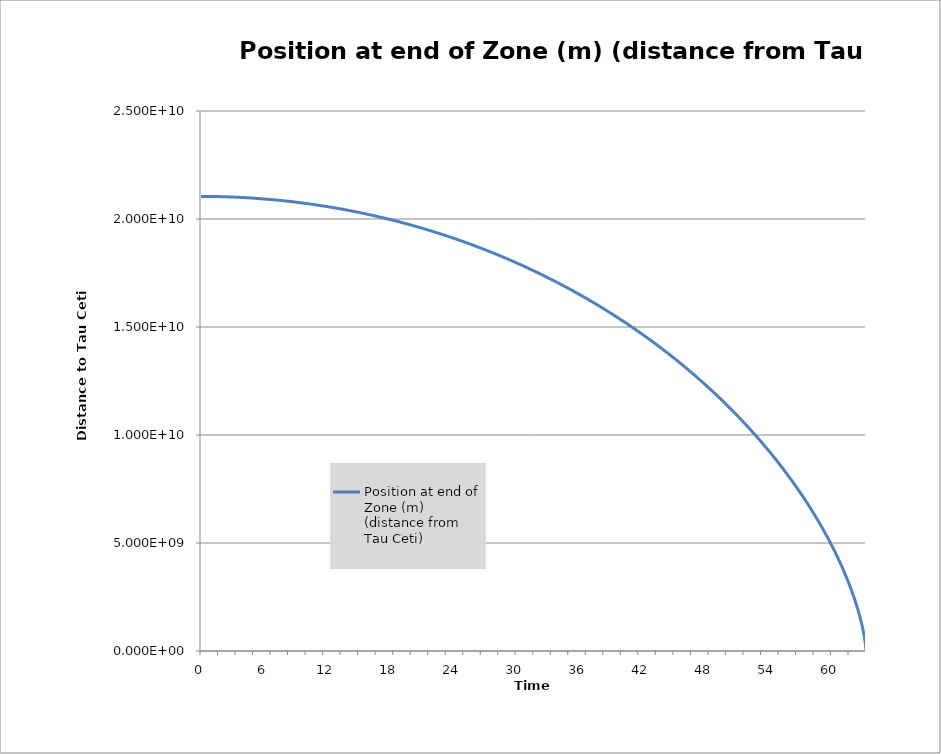
| Category | Position at end of Zone (m) (distance from Tau Ceti) |
|---|---|
| 0.0 | 21045999099.302 |
| 0.016666666666666666 | 21045996397.209 |
| 0.03333333333333333 | 21045991893.72 |
| 0.05 | 21045985588.834 |
| 0.06666666666666667 | 21045977482.551 |
| 0.08333333333333333 | 21045967574.87 |
| 0.09999999999999999 | 21045955865.788 |
| 0.11666666666666665 | 21045942355.304 |
| 0.13333333333333333 | 21045927043.416 |
| 0.15 | 21045909930.122 |
| 0.16666666666666666 | 21045891015.418 |
| 0.18333333333333332 | 21045870299.302 |
| 0.19999999999999998 | 21045847781.769 |
| 0.21666666666666665 | 21045823462.817 |
| 0.2333333333333333 | 21045797342.442 |
| 0.24999999999999997 | 21045769420.638 |
| 0.26666666666666666 | 21045739697.402 |
| 0.2833333333333333 | 21045708172.729 |
| 0.3 | 21045674846.613 |
| 0.31666666666666665 | 21045639719.048 |
| 0.3333333333333333 | 21045602790.03 |
| 0.35 | 21045564059.551 |
| 0.36666666666666664 | 21045523527.605 |
| 0.3833333333333333 | 21045481194.186 |
| 0.39999999999999997 | 21045437059.286 |
| 0.41666666666666663 | 21045391122.898 |
| 0.4333333333333333 | 21045343385.015 |
| 0.44999999999999996 | 21045293845.627 |
| 0.4666666666666666 | 21045242504.728 |
| 0.4833333333333333 | 21045189362.307 |
| 0.49999999999999994 | 21045134418.358 |
| 0.5166666666666666 | 21045077672.869 |
| 0.5333333333333333 | 21045019125.831 |
| 0.55 | 21044958777.235 |
| 0.5666666666666668 | 21044896627.071 |
| 0.5833333333333335 | 21044832675.328 |
| 0.6000000000000002 | 21044766921.995 |
| 0.6166666666666669 | 21044699367.061 |
| 0.6333333333333336 | 21044630010.514 |
| 0.6500000000000004 | 21044558852.344 |
| 0.6666666666666671 | 21044485892.537 |
| 0.6833333333333338 | 21044411131.082 |
| 0.7000000000000005 | 21044334567.966 |
| 0.7166666666666672 | 21044256203.176 |
| 0.733333333333334 | 21044176036.698 |
| 0.7500000000000007 | 21044094068.52 |
| 0.7666666666666674 | 21044010298.627 |
| 0.7833333333333341 | 21043924727.005 |
| 0.8000000000000008 | 21043837353.639 |
| 0.8166666666666675 | 21043748178.515 |
| 0.8333333333333343 | 21043657201.618 |
| 0.850000000000001 | 21043564422.932 |
| 0.8666666666666677 | 21043469842.442 |
| 0.8833333333333344 | 21043373460.131 |
| 0.9000000000000011 | 21043275275.983 |
| 0.9166666666666679 | 21043175289.982 |
| 0.9333333333333346 | 21043073502.11 |
| 0.9500000000000013 | 21042969912.35 |
| 0.966666666666668 | 21042864520.685 |
| 0.9833333333333347 | 21042757327.096 |
| 1.0000000000000013 | 21042648331.566 |
| 1.016666666666668 | 21042537534.076 |
| 1.0333333333333345 | 21042424934.607 |
| 1.0500000000000012 | 21042310533.14 |
| 1.0666666666666678 | 21042194329.656 |
| 1.0833333333333344 | 21042076324.134 |
| 1.100000000000001 | 21041956516.556 |
| 1.1166666666666676 | 21041834906.899 |
| 1.1333333333333342 | 21041711495.145 |
| 1.1500000000000008 | 21041586281.271 |
| 1.1666666666666674 | 21041459265.257 |
| 1.183333333333334 | 21041330447.08 |
| 1.2000000000000006 | 21041199826.72 |
| 1.2166666666666672 | 21041067404.153 |
| 1.2333333333333338 | 21040933179.357 |
| 1.2500000000000004 | 21040797152.31 |
| 1.266666666666667 | 21040659322.988 |
| 1.2833333333333337 | 21040519691.368 |
| 1.3000000000000003 | 21040378257.426 |
| 1.3166666666666669 | 21040235021.137 |
| 1.3333333333333335 | 21040089982.478 |
| 1.35 | 21039943141.424 |
| 1.3666666666666667 | 21039794497.95 |
| 1.3833333333333333 | 21039644052.03 |
| 1.4 | 21039491803.64 |
| 1.4166666666666665 | 21039337752.752 |
| 1.4333333333333331 | 21039181899.34 |
| 1.4499999999999997 | 21039024243.379 |
| 1.4666666666666663 | 21038864784.842 |
| 1.483333333333333 | 21038703523.7 |
| 1.4999999999999996 | 21038540459.927 |
| 1.5166666666666662 | 21038375593.495 |
| 1.5333333333333328 | 21038208924.376 |
| 1.5499999999999994 | 21038040452.541 |
| 1.566666666666666 | 21037870177.962 |
| 1.5833333333333326 | 21037698100.609 |
| 1.5999999999999992 | 21037524220.454 |
| 1.6166666666666658 | 21037348537.466 |
| 1.6333333333333324 | 21037171051.616 |
| 1.649999999999999 | 21036991762.873 |
| 1.6666666666666656 | 21036810671.207 |
| 1.6833333333333322 | 21036627776.587 |
| 1.6999999999999988 | 21036443078.982 |
| 1.7166666666666655 | 21036256578.36 |
| 1.733333333333332 | 21036068274.69 |
| 1.7499999999999987 | 21035878167.938 |
| 1.7666666666666653 | 21035686258.074 |
| 1.7833333333333319 | 21035492545.064 |
| 1.7999999999999985 | 21035297028.875 |
| 1.816666666666665 | 21035099709.473 |
| 1.8333333333333317 | 21034900586.826 |
| 1.8499999999999983 | 21034699660.898 |
| 1.866666666666665 | 21034496931.657 |
| 1.8833333333333315 | 21034292399.066 |
| 1.8999999999999981 | 21034086063.092 |
| 1.9166666666666647 | 21033877923.698 |
| 1.9333333333333313 | 21033667980.851 |
| 1.949999999999998 | 21033456234.512 |
| 1.9666666666666646 | 21033242684.648 |
| 1.9833333333333312 | 21033027331.22 |
| 1.9999999999999978 | 21032810174.192 |
| 2.0166666666666644 | 21032591213.528 |
| 2.033333333333331 | 21032370449.189 |
| 2.0499999999999976 | 21032147881.138 |
| 2.066666666666664 | 21031923509.338 |
| 2.083333333333331 | 21031697333.749 |
| 2.0999999999999974 | 21031469354.332 |
| 2.116666666666664 | 21031239571.05 |
| 2.1333333333333306 | 21031007983.863 |
| 2.1499999999999972 | 21030774592.731 |
| 2.166666666666664 | 21030539397.615 |
| 2.1833333333333305 | 21030302398.473 |
| 2.199999999999997 | 21030063595.266 |
| 2.2166666666666637 | 21029822987.954 |
| 2.2333333333333303 | 21029580576.493 |
| 2.249999999999997 | 21029336360.844 |
| 2.2666666666666635 | 21029090340.965 |
| 2.28333333333333 | 21028842516.813 |
| 2.2999999999999967 | 21028592888.346 |
| 2.3166666666666633 | 21028341455.521 |
| 2.33333333333333 | 21028088218.296 |
| 2.3499999999999965 | 21027833176.627 |
| 2.366666666666663 | 21027576330.47 |
| 2.3833333333333298 | 21027317679.782 |
| 2.3999999999999964 | 21027057224.519 |
| 2.416666666666663 | 21026794964.635 |
| 2.4333333333333296 | 21026530900.086 |
| 2.449999999999996 | 21026265030.826 |
| 2.466666666666663 | 21025997356.811 |
| 2.4833333333333294 | 21025727877.995 |
| 2.499999999999996 | 21025456594.33 |
| 2.5166666666666626 | 21025183505.772 |
| 2.533333333333329 | 21024908612.273 |
| 2.549999999999996 | 21024631913.786 |
| 2.5666666666666624 | 21024353410.264 |
| 2.583333333333329 | 21024073101.659 |
| 2.5999999999999956 | 21023790987.923 |
| 2.6166666666666623 | 21023507069.008 |
| 2.633333333333329 | 21023221344.865 |
| 2.6499999999999955 | 21022933815.445 |
| 2.666666666666662 | 21022644480.7 |
| 2.6833333333333287 | 21022353340.579 |
| 2.6999999999999953 | 21022060395.033 |
| 2.716666666666662 | 21021765644.012 |
| 2.7333333333333285 | 21021469087.464 |
| 2.749999999999995 | 21021170725.34 |
| 2.7666666666666617 | 21020870557.588 |
| 2.7833333333333283 | 21020568584.157 |
| 2.799999999999995 | 21020264804.995 |
| 2.8166666666666615 | 21019959220.05 |
| 2.833333333333328 | 21019651829.269 |
| 2.8499999999999948 | 21019342632.601 |
| 2.8666666666666614 | 21019031629.992 |
| 2.883333333333328 | 21018718821.388 |
| 2.8999999999999946 | 21018404206.737 |
| 2.916666666666661 | 21018087785.984 |
| 2.933333333333328 | 21017769559.074 |
| 2.9499999999999944 | 21017449525.955 |
| 2.966666666666661 | 21017127686.57 |
| 2.9833333333333276 | 21016804040.864 |
| 2.9999999999999942 | 21016478588.783 |
| 3.016666666666661 | 21016151330.269 |
| 3.0333333333333274 | 21015822265.268 |
| 3.049999999999994 | 21015491393.722 |
| 3.0666666666666607 | 21015158715.576 |
| 3.0833333333333273 | 21014824230.771 |
| 3.099999999999994 | 21014487939.251 |
| 3.1166666666666605 | 21014149840.957 |
| 3.133333333333327 | 21013809935.833 |
| 3.1499999999999937 | 21013468223.819 |
| 3.1666666666666603 | 21013124704.857 |
| 3.183333333333327 | 21012779378.888 |
| 3.1999999999999935 | 21012432245.853 |
| 3.21666666666666 | 21012083305.693 |
| 3.2333333333333267 | 21011732558.346 |
| 3.2499999999999933 | 21011380003.754 |
| 3.26666666666666 | 21011025641.856 |
| 3.2833333333333266 | 21010669472.591 |
| 3.299999999999993 | 21010311495.897 |
| 3.3166666666666598 | 21009951711.714 |
| 3.3333333333333264 | 21009590119.979 |
| 3.349999999999993 | 21009226720.631 |
| 3.3666666666666596 | 21008861513.607 |
| 3.383333333333326 | 21008494498.845 |
| 3.399999999999993 | 21008125676.281 |
| 3.4166666666666594 | 21007755045.852 |
| 3.433333333333326 | 21007382607.495 |
| 3.4499999999999926 | 21007008361.146 |
| 3.4666666666666592 | 21006632306.739 |
| 3.483333333333326 | 21006254444.212 |
| 3.4999999999999925 | 21005874773.498 |
| 3.516666666666659 | 21005493294.533 |
| 3.5333333333333257 | 21005110007.251 |
| 3.5499999999999923 | 21004724911.586 |
| 3.566666666666659 | 21004338007.473 |
| 3.5833333333333255 | 21003949294.844 |
| 3.599999999999992 | 21003558773.633 |
| 3.6166666666666587 | 21003166443.773 |
| 3.6333333333333253 | 21002772305.196 |
| 3.649999999999992 | 21002376357.834 |
| 3.6666666666666585 | 21001978601.621 |
| 3.683333333333325 | 21001579036.486 |
| 3.6999999999999917 | 21001177662.362 |
| 3.7166666666666583 | 21000774479.18 |
| 3.733333333333325 | 21000369486.87 |
| 3.7499999999999916 | 20999962685.362 |
| 3.766666666666658 | 20999554074.588 |
| 3.7833333333333248 | 20999143654.475 |
| 3.7999999999999914 | 20998731424.955 |
| 3.816666666666658 | 20998317385.955 |
| 3.8333333333333246 | 20997901537.405 |
| 3.849999999999991 | 20997483879.234 |
| 3.866666666666658 | 20997064411.369 |
| 3.8833333333333244 | 20996643133.738 |
| 3.899999999999991 | 20996220046.269 |
| 3.9166666666666576 | 20995795148.889 |
| 3.9333333333333242 | 20995368441.525 |
| 3.949999999999991 | 20994939924.104 |
| 3.9666666666666575 | 20994509596.551 |
| 3.983333333333324 | 20994077458.793 |
| 3.9999999999999907 | 20993643510.755 |
| 4.016666666666658 | 20993207752.363 |
| 4.033333333333324 | 20992770183.542 |
| 4.049999999999991 | 20992330804.216 |
| 4.0666666666666575 | 20991889614.31 |
| 4.083333333333324 | 20991446613.748 |
| 4.099999999999991 | 20991001802.453 |
| 4.116666666666657 | 20990555180.349 |
| 4.133333333333324 | 20990106747.359 |
| 4.149999999999991 | 20989656503.406 |
| 4.166666666666657 | 20989204448.412 |
| 4.183333333333324 | 20988750582.3 |
| 4.19999999999999 | 20988294904.991 |
| 4.216666666666657 | 20987837416.406 |
| 4.233333333333324 | 20987378116.468 |
| 4.24999999999999 | 20986917005.096 |
| 4.266666666666657 | 20986454082.212 |
| 4.2833333333333234 | 20985989347.735 |
| 4.29999999999999 | 20985522801.586 |
| 4.316666666666657 | 20985054443.684 |
| 4.333333333333323 | 20984584273.949 |
| 4.34999999999999 | 20984112292.299 |
| 4.3666666666666565 | 20983638498.653 |
| 4.383333333333323 | 20983162892.929 |
| 4.39999999999999 | 20982685475.046 |
| 4.416666666666656 | 20982206244.921 |
| 4.433333333333323 | 20981725202.471 |
| 4.4499999999999895 | 20981242347.614 |
| 4.466666666666656 | 20980757680.266 |
| 4.483333333333323 | 20980271200.343 |
| 4.499999999999989 | 20979782907.763 |
| 4.516666666666656 | 20979292802.44 |
| 4.533333333333323 | 20978800884.29 |
| 4.549999999999989 | 20978307153.228 |
| 4.566666666666656 | 20977811609.169 |
| 4.583333333333322 | 20977314252.027 |
| 4.599999999999989 | 20976815081.718 |
| 4.616666666666656 | 20976314098.153 |
| 4.633333333333322 | 20975811301.248 |
| 4.649999999999989 | 20975306690.915 |
| 4.666666666666655 | 20974800267.067 |
| 4.683333333333322 | 20974292029.617 |
| 4.699999999999989 | 20973781978.477 |
| 4.716666666666655 | 20973270113.559 |
| 4.733333333333322 | 20972756434.775 |
| 4.7499999999999885 | 20972240942.035 |
| 4.766666666666655 | 20971723635.251 |
| 4.783333333333322 | 20971204514.334 |
| 4.799999999999988 | 20970683579.194 |
| 4.816666666666655 | 20970160829.741 |
| 4.8333333333333215 | 20969636265.884 |
| 4.849999999999988 | 20969109887.534 |
| 4.866666666666655 | 20968581694.598 |
| 4.883333333333321 | 20968051686.986 |
| 4.899999999999988 | 20967519864.607 |
| 4.9166666666666545 | 20966986227.367 |
| 4.933333333333321 | 20966450775.176 |
| 4.949999999999988 | 20965913507.94 |
| 4.966666666666654 | 20965374425.567 |
| 4.983333333333321 | 20964833527.964 |
| 4.999999999999988 | 20964290815.036 |
| 5.016666666666654 | 20963746286.691 |
| 5.033333333333321 | 20963199942.834 |
| 5.049999999999987 | 20962651783.37 |
| 5.066666666666654 | 20962101808.205 |
| 5.083333333333321 | 20961550017.243 |
| 5.099999999999987 | 20960996410.39 |
| 5.116666666666654 | 20960440987.549 |
| 5.13333333333332 | 20959883748.624 |
| 5.149999999999987 | 20959324693.52 |
| 5.166666666666654 | 20958763822.138 |
| 5.18333333333332 | 20958201134.383 |
| 5.199999999999987 | 20957636630.156 |
| 5.2166666666666535 | 20957070309.36 |
| 5.23333333333332 | 20956502171.898 |
| 5.249999999999987 | 20955932217.67 |
| 5.266666666666653 | 20955360446.578 |
| 5.28333333333332 | 20954786858.523 |
| 5.2999999999999865 | 20954211453.406 |
| 5.316666666666653 | 20953634231.127 |
| 5.33333333333332 | 20953055191.586 |
| 5.349999999999986 | 20952474334.683 |
| 5.366666666666653 | 20951891660.318 |
| 5.3833333333333195 | 20951307168.388 |
| 5.399999999999986 | 20950720858.794 |
| 5.416666666666653 | 20950132731.433 |
| 5.433333333333319 | 20949542786.203 |
| 5.449999999999986 | 20948951023.003 |
| 5.466666666666653 | 20948357441.73 |
| 5.483333333333319 | 20947762042.281 |
| 5.499999999999986 | 20947164824.552 |
| 5.516666666666652 | 20946565788.441 |
| 5.533333333333319 | 20945964933.843 |
| 5.549999999999986 | 20945362260.654 |
| 5.566666666666652 | 20944757768.77 |
| 5.583333333333319 | 20944151458.086 |
| 5.599999999999985 | 20943543328.496 |
| 5.616666666666652 | 20942933379.896 |
| 5.633333333333319 | 20942321612.179 |
| 5.649999999999985 | 20941708025.24 |
| 5.666666666666652 | 20941092618.971 |
| 5.6833333333333185 | 20940475393.266 |
| 5.699999999999985 | 20939856348.019 |
| 5.716666666666652 | 20939235483.121 |
| 5.733333333333318 | 20938612798.465 |
| 5.749999999999985 | 20937988293.943 |
| 5.7666666666666515 | 20937361969.446 |
| 5.783333333333318 | 20936733824.865 |
| 5.799999999999985 | 20936103860.092 |
| 5.816666666666651 | 20935472075.018 |
| 5.833333333333318 | 20934838469.532 |
| 5.8499999999999845 | 20934203043.524 |
| 5.866666666666651 | 20933565796.885 |
| 5.883333333333318 | 20932926729.503 |
| 5.899999999999984 | 20932285841.267 |
| 5.916666666666651 | 20931643132.066 |
| 5.933333333333318 | 20930998601.789 |
| 5.949999999999984 | 20930352250.323 |
| 5.966666666666651 | 20929704077.556 |
| 5.983333333333317 | 20929054083.376 |
| 5.999999999999984 | 20928402267.669 |
| 6.016666666666651 | 20927748630.322 |
| 6.033333333333317 | 20927093171.222 |
| 6.049999999999984 | 20926435890.254 |
| 6.06666666666665 | 20925776787.304 |
| 6.083333333333317 | 20925115862.258 |
| 6.099999999999984 | 20924453115.001 |
| 6.11666666666665 | 20923788545.418 |
| 6.133333333333317 | 20923122153.392 |
| 6.1499999999999835 | 20922453938.808 |
| 6.16666666666665 | 20921783901.549 |
| 6.183333333333317 | 20921112041.5 |
| 6.199999999999983 | 20920438358.543 |
| 6.21666666666665 | 20919762852.56 |
| 6.2333333333333165 | 20919085523.435 |
| 6.249999999999983 | 20918406371.05 |
| 6.26666666666665 | 20917725395.285 |
| 6.283333333333316 | 20917042596.024 |
| 6.299999999999983 | 20916357973.146 |
| 6.3166666666666496 | 20915671526.532 |
| 6.333333333333316 | 20914983256.064 |
| 6.349999999999983 | 20914293161.62 |
| 6.366666666666649 | 20913601243.082 |
| 6.383333333333316 | 20912907500.327 |
| 6.399999999999983 | 20912211933.237 |
| 6.416666666666649 | 20911514541.688 |
| 6.433333333333316 | 20910815325.56 |
| 6.449999999999982 | 20910114284.731 |
| 6.466666666666649 | 20909411419.079 |
| 6.483333333333316 | 20908706728.481 |
| 6.499999999999982 | 20908000212.814 |
| 6.516666666666649 | 20907291871.956 |
| 6.5333333333333155 | 20906581705.781 |
| 6.549999999999982 | 20905869714.168 |
| 6.566666666666649 | 20905155896.991 |
| 6.583333333333315 | 20904440254.127 |
| 6.599999999999982 | 20903722785.449 |
| 6.6166666666666485 | 20903003490.834 |
| 6.633333333333315 | 20902282370.155 |
| 6.649999999999982 | 20901559423.287 |
| 6.666666666666648 | 20900834650.103 |
| 6.683333333333315 | 20900108050.478 |
| 6.6999999999999815 | 20899379624.283 |
| 6.716666666666648 | 20898649371.393 |
| 6.733333333333315 | 20897917291.679 |
| 6.749999999999981 | 20897183385.014 |
| 6.766666666666648 | 20896447651.27 |
| 6.783333333333315 | 20895710090.317 |
| 6.799999999999981 | 20894970702.028 |
| 6.816666666666648 | 20894229486.273 |
| 6.833333333333314 | 20893486442.922 |
| 6.849999999999981 | 20892741571.846 |
| 6.866666666666648 | 20891994872.914 |
| 6.883333333333314 | 20891246345.997 |
| 6.899999999999981 | 20890495990.963 |
| 6.916666666666647 | 20889743807.681 |
| 6.933333333333314 | 20888989796.019 |
| 6.949999999999981 | 20888233955.846 |
| 6.966666666666647 | 20887476287.03 |
| 6.983333333333314 | 20886716789.438 |
| 6.9999999999999805 | 20885955462.937 |
| 7.016666666666647 | 20885192307.394 |
| 7.033333333333314 | 20884427322.675 |
| 7.04999999999998 | 20883660508.647 |
| 7.066666666666647 | 20882891865.176 |
| 7.0833333333333135 | 20882121392.127 |
| 7.09999999999998 | 20881349089.365 |
| 7.116666666666647 | 20880574956.754 |
| 7.133333333333313 | 20879798994.161 |
| 7.14999999999998 | 20879021201.448 |
| 7.1666666666666465 | 20878241578.479 |
| 7.183333333333313 | 20877460125.118 |
| 7.19999999999998 | 20876676841.228 |
| 7.216666666666646 | 20875891726.672 |
| 7.233333333333313 | 20875104781.312 |
| 7.24999999999998 | 20874316005.01 |
| 7.266666666666646 | 20873525397.629 |
| 7.283333333333313 | 20872732959.029 |
| 7.299999999999979 | 20871938689.072 |
| 7.316666666666646 | 20871142587.619 |
| 7.333333333333313 | 20870344654.53 |
| 7.349999999999979 | 20869544889.664 |
| 7.366666666666646 | 20868743292.883 |
| 7.383333333333312 | 20867939864.044 |
| 7.399999999999979 | 20867134603.008 |
| 7.416666666666646 | 20866327509.633 |
| 7.433333333333312 | 20865518583.778 |
| 7.449999999999979 | 20864707825.3 |
| 7.4666666666666455 | 20863895234.058 |
| 7.483333333333312 | 20863080809.908 |
| 7.499999999999979 | 20862264552.708 |
| 7.516666666666645 | 20861446462.315 |
| 7.533333333333312 | 20860626538.584 |
| 7.5499999999999785 | 20859804781.373 |
| 7.566666666666645 | 20858981190.536 |
| 7.583333333333312 | 20858155765.929 |
| 7.599999999999978 | 20857328507.407 |
| 7.616666666666645 | 20856499414.825 |
| 7.6333333333333115 | 20855668488.036 |
| 7.649999999999978 | 20854835726.896 |
| 7.666666666666645 | 20854001131.258 |
| 7.683333333333311 | 20853164700.975 |
| 7.699999999999978 | 20852326435.899 |
| 7.716666666666645 | 20851486335.885 |
| 7.733333333333311 | 20850644400.783 |
| 7.749999999999978 | 20849800630.446 |
| 7.766666666666644 | 20848955024.726 |
| 7.783333333333311 | 20848107583.474 |
| 7.799999999999978 | 20847258306.54 |
| 7.816666666666644 | 20846407193.776 |
| 7.833333333333311 | 20845554245.032 |
| 7.849999999999977 | 20844699460.157 |
| 7.866666666666644 | 20843842839.001 |
| 7.883333333333311 | 20842984381.414 |
| 7.899999999999977 | 20842124087.243 |
| 7.916666666666644 | 20841261956.339 |
| 7.9333333333333105 | 20840397988.549 |
| 7.949999999999977 | 20839532183.72 |
| 7.966666666666644 | 20838664541.701 |
| 7.98333333333331 | 20837795062.338 |
| 7.999999999999977 | 20836923745.479 |
| 8.016666666666644 | 20836050590.97 |
| 8.033333333333312 | 20835175598.656 |
| 8.04999999999998 | 20834298768.385 |
| 8.066666666666647 | 20833420100 |
| 8.083333333333314 | 20832539593.348 |
| 8.099999999999982 | 20831657248.273 |
| 8.11666666666665 | 20830773064.62 |
| 8.133333333333317 | 20829887042.233 |
| 8.149999999999984 | 20828999180.955 |
| 8.166666666666652 | 20828109480.629 |
| 8.18333333333332 | 20827217941.1 |
| 8.199999999999987 | 20826324562.209 |
| 8.216666666666654 | 20825429343.799 |
| 8.233333333333322 | 20824532285.711 |
| 8.24999999999999 | 20823633387.789 |
| 8.266666666666657 | 20822732649.872 |
| 8.283333333333324 | 20821830071.802 |
| 8.299999999999992 | 20820925653.42 |
| 8.31666666666666 | 20820019394.566 |
| 8.333333333333327 | 20819111295.079 |
| 8.349999999999994 | 20818201354.799 |
| 8.366666666666662 | 20817289573.566 |
| 8.38333333333333 | 20816375951.219 |
| 8.399999999999997 | 20815460487.596 |
| 8.416666666666664 | 20814543182.534 |
| 8.433333333333332 | 20813624035.873 |
| 8.45 | 20812703047.45 |
| 8.466666666666667 | 20811780217.101 |
| 8.483333333333334 | 20810855544.663 |
| 8.500000000000002 | 20809929029.974 |
| 8.51666666666667 | 20809000672.869 |
| 8.533333333333337 | 20808070473.184 |
| 8.550000000000004 | 20807138430.754 |
| 8.566666666666672 | 20806204545.415 |
| 8.58333333333334 | 20805268817 |
| 8.600000000000007 | 20804331245.346 |
| 8.616666666666674 | 20803391830.285 |
| 8.633333333333342 | 20802450571.651 |
| 8.65000000000001 | 20801507469.277 |
| 8.666666666666677 | 20800562522.997 |
| 8.683333333333344 | 20799615732.643 |
| 8.700000000000012 | 20798667098.048 |
| 8.71666666666668 | 20797716619.043 |
| 8.733333333333347 | 20796764295.46 |
| 8.750000000000014 | 20795810127.13 |
| 8.766666666666682 | 20794854113.885 |
| 8.78333333333335 | 20793896255.554 |
| 8.800000000000017 | 20792936551.967 |
| 8.816666666666684 | 20791975002.955 |
| 8.833333333333352 | 20791011608.348 |
| 8.85000000000002 | 20790046367.973 |
| 8.866666666666687 | 20789079281.661 |
| 8.883333333333354 | 20788110349.238 |
| 8.900000000000022 | 20787139570.535 |
| 8.91666666666669 | 20786166945.377 |
| 8.933333333333357 | 20785192473.593 |
| 8.950000000000024 | 20784216155.01 |
| 8.966666666666692 | 20783237989.454 |
| 8.98333333333336 | 20782257976.751 |
| 9.000000000000027 | 20781276116.728 |
| 9.016666666666694 | 20780292409.21 |
| 9.033333333333362 | 20779306854.022 |
| 9.05000000000003 | 20778319450.99 |
| 9.066666666666697 | 20777330199.937 |
| 9.083333333333364 | 20776339100.688 |
| 9.100000000000032 | 20775346153.067 |
| 9.1166666666667 | 20774351356.897 |
| 9.133333333333367 | 20773354712.002 |
| 9.150000000000034 | 20772356218.204 |
| 9.166666666666702 | 20771355875.325 |
| 9.183333333333369 | 20770353683.189 |
| 9.200000000000037 | 20769349641.615 |
| 9.216666666666704 | 20768343750.426 |
| 9.233333333333372 | 20767336009.443 |
| 9.250000000000039 | 20766326418.486 |
| 9.266666666666707 | 20765314977.376 |
| 9.283333333333374 | 20764301685.933 |
| 9.300000000000042 | 20763286543.975 |
| 9.316666666666709 | 20762269551.323 |
| 9.333333333333377 | 20761250707.795 |
| 9.350000000000044 | 20760230013.21 |
| 9.366666666666712 | 20759207467.386 |
| 9.383333333333379 | 20758183070.14 |
| 9.400000000000047 | 20757156821.291 |
| 9.416666666666714 | 20756128720.655 |
| 9.433333333333382 | 20755098768.048 |
| 9.450000000000049 | 20754066963.288 |
| 9.466666666666717 | 20753033306.19 |
| 9.483333333333384 | 20751997796.57 |
| 9.500000000000052 | 20750960434.243 |
| 9.516666666666719 | 20749921219.024 |
| 9.533333333333387 | 20748880150.728 |
| 9.550000000000054 | 20747837229.169 |
| 9.566666666666721 | 20746792454.161 |
| 9.583333333333389 | 20745745825.516 |
| 9.600000000000056 | 20744697343.049 |
| 9.616666666666724 | 20743647006.573 |
| 9.633333333333391 | 20742594815.898 |
| 9.650000000000059 | 20741540770.839 |
| 9.666666666666726 | 20740484871.206 |
| 9.683333333333394 | 20739427116.81 |
| 9.700000000000061 | 20738367507.463 |
| 9.716666666666729 | 20737306042.975 |
| 9.733333333333396 | 20736242723.157 |
| 9.750000000000064 | 20735177547.818 |
| 9.766666666666731 | 20734110516.768 |
| 9.783333333333399 | 20733041629.815 |
| 9.800000000000066 | 20731970886.77 |
| 9.816666666666734 | 20730898287.44 |
| 9.833333333333401 | 20729823831.634 |
| 9.850000000000069 | 20728747519.158 |
| 9.866666666666736 | 20727669349.821 |
| 9.883333333333404 | 20726589323.43 |
| 9.900000000000071 | 20725507439.79 |
| 9.916666666666739 | 20724423698.709 |
| 9.933333333333406 | 20723338099.992 |
| 9.950000000000074 | 20722250643.445 |
| 9.966666666666741 | 20721161328.873 |
| 9.983333333333409 | 20720070156.08 |
| 10.000000000000076 | 20718977124.872 |
| 10.016666666666744 | 20717882235.053 |
| 10.033333333333411 | 20716785486.425 |
| 10.050000000000079 | 20715686878.792 |
| 10.066666666666746 | 20714586411.958 |
| 10.083333333333414 | 20713484085.725 |
| 10.100000000000081 | 20712379899.896 |
| 10.116666666666749 | 20711273854.271 |
| 10.133333333333416 | 20710165948.653 |
| 10.150000000000084 | 20709056182.843 |
| 10.166666666666751 | 20707944556.642 |
| 10.183333333333419 | 20706831069.849 |
| 10.200000000000086 | 20705715722.266 |
| 10.216666666666754 | 20704598513.692 |
| 10.233333333333421 | 20703479443.926 |
| 10.250000000000089 | 20702358512.767 |
| 10.266666666666756 | 20701235720.014 |
| 10.283333333333424 | 20700111065.464 |
| 10.300000000000091 | 20698984548.917 |
| 10.316666666666759 | 20697856170.169 |
| 10.333333333333426 | 20696725929.017 |
| 10.350000000000094 | 20695593825.259 |
| 10.366666666666761 | 20694459858.69 |
| 10.383333333333429 | 20693324029.107 |
| 10.400000000000096 | 20692186336.305 |
| 10.416666666666764 | 20691046780.079 |
| 10.433333333333431 | 20689905360.225 |
| 10.450000000000099 | 20688762076.537 |
| 10.466666666666766 | 20687616928.81 |
| 10.483333333333434 | 20686469916.836 |
| 10.500000000000101 | 20685321040.409 |
| 10.516666666666769 | 20684170299.323 |
| 10.533333333333436 | 20683017693.371 |
| 10.550000000000104 | 20681863222.343 |
| 10.566666666666771 | 20680706886.034 |
| 10.583333333333439 | 20679548684.233 |
| 10.600000000000106 | 20678388616.732 |
| 10.616666666666774 | 20677226683.323 |
| 10.633333333333441 | 20676062883.795 |
| 10.650000000000109 | 20674897217.938 |
| 10.666666666666776 | 20673729685.543 |
| 10.683333333333444 | 20672560286.399 |
| 10.700000000000111 | 20671389020.294 |
| 10.716666666666779 | 20670215887.017 |
| 10.733333333333446 | 20669040886.357 |
| 10.750000000000114 | 20667864018.101 |
| 10.766666666666781 | 20666685282.038 |
| 10.783333333333449 | 20665504677.953 |
| 10.800000000000116 | 20664322205.633 |
| 10.816666666666784 | 20663137864.866 |
| 10.833333333333451 | 20661951655.436 |
| 10.850000000000119 | 20660763577.131 |
| 10.866666666666786 | 20659573629.734 |
| 10.883333333333454 | 20658381813.03 |
| 10.900000000000121 | 20657188126.805 |
| 10.916666666666789 | 20655992570.842 |
| 10.933333333333456 | 20654795144.926 |
| 10.950000000000124 | 20653595848.838 |
| 10.966666666666791 | 20652394682.363 |
| 10.983333333333459 | 20651191645.283 |
| 11.000000000000126 | 20649986737.38 |
| 11.016666666666794 | 20648779958.436 |
| 11.033333333333461 | 20647571308.232 |
| 11.050000000000129 | 20646360786.55 |
| 11.066666666666796 | 20645148393.17 |
| 11.083333333333464 | 20643934127.873 |
| 11.100000000000131 | 20642717990.439 |
| 11.116666666666799 | 20641499980.647 |
| 11.133333333333466 | 20640280098.276 |
| 11.150000000000134 | 20639058343.105 |
| 11.166666666666801 | 20637834714.913 |
| 11.183333333333469 | 20636609213.477 |
| 11.200000000000136 | 20635381838.576 |
| 11.216666666666804 | 20634152589.987 |
| 11.233333333333471 | 20632921467.486 |
| 11.250000000000139 | 20631688470.851 |
| 11.266666666666806 | 20630453599.856 |
| 11.283333333333474 | 20629216854.279 |
| 11.300000000000141 | 20627978233.895 |
| 11.316666666666809 | 20626737738.478 |
| 11.333333333333476 | 20625495367.803 |
| 11.350000000000144 | 20624251121.644 |
| 11.366666666666811 | 20623004999.776 |
| 11.383333333333479 | 20621757001.972 |
| 11.400000000000146 | 20620507128.005 |
| 11.416666666666814 | 20619255377.647 |
| 11.433333333333481 | 20618001750.671 |
| 11.450000000000149 | 20616746246.849 |
| 11.466666666666816 | 20615488865.953 |
| 11.483333333333483 | 20614229607.754 |
| 11.500000000000151 | 20612968472.022 |
| 11.516666666666818 | 20611705458.528 |
| 11.533333333333486 | 20610440567.042 |
| 11.550000000000153 | 20609173797.334 |
| 11.566666666666821 | 20607905149.173 |
| 11.583333333333488 | 20606634622.328 |
| 11.600000000000156 | 20605362216.567 |
| 11.616666666666823 | 20604087931.658 |
| 11.633333333333491 | 20602811767.37 |
| 11.650000000000158 | 20601533723.469 |
| 11.666666666666826 | 20600253799.723 |
| 11.683333333333493 | 20598971995.898 |
| 11.700000000000161 | 20597688311.76 |
| 11.716666666666828 | 20596402747.076 |
| 11.733333333333496 | 20595115301.61 |
| 11.750000000000163 | 20593825975.127 |
| 11.766666666666831 | 20592534767.393 |
| 11.783333333333498 | 20591241678.171 |
| 11.800000000000166 | 20589946707.226 |
| 11.816666666666833 | 20588649854.32 |
| 11.833333333333501 | 20587351119.217 |
| 11.850000000000168 | 20586050501.68 |
| 11.866666666666836 | 20584748001.47 |
| 11.883333333333503 | 20583443618.351 |
| 11.90000000000017 | 20582137352.082 |
| 11.916666666666838 | 20580829202.427 |
| 11.933333333333506 | 20579519169.144 |
| 11.950000000000173 | 20578207251.995 |
| 11.96666666666684 | 20576893450.739 |
| 11.983333333333508 | 20575577765.137 |
| 12.000000000000176 | 20574260194.947 |
| 12.016666666666843 | 20572940739.928 |
| 12.03333333333351 | 20571619399.839 |
| 12.050000000000178 | 20570296174.437 |
| 12.066666666666846 | 20568971063.48 |
| 12.083333333333513 | 20567644066.726 |
| 12.10000000000018 | 20566315183.931 |
| 12.116666666666848 | 20564984414.851 |
| 12.133333333333516 | 20563651759.244 |
| 12.150000000000183 | 20562317216.863 |
| 12.16666666666685 | 20560980787.465 |
| 12.183333333333518 | 20559642470.805 |
| 12.200000000000186 | 20558302266.637 |
| 12.216666666666853 | 20556960174.714 |
| 12.23333333333352 | 20555616194.792 |
| 12.250000000000188 | 20554270326.622 |
| 12.266666666666856 | 20552922569.958 |
| 12.283333333333523 | 20551572924.553 |
| 12.30000000000019 | 20550221390.158 |
| 12.316666666666858 | 20548867966.526 |
| 12.333333333333526 | 20547512653.407 |
| 12.350000000000193 | 20546155450.552 |
| 12.36666666666686 | 20544796357.712 |
| 12.383333333333528 | 20543435374.638 |
| 12.400000000000196 | 20542072501.078 |
| 12.416666666666863 | 20540707736.782 |
| 12.43333333333353 | 20539341081.499 |
| 12.450000000000198 | 20537972534.978 |
| 12.466666666666866 | 20536602096.967 |
| 12.483333333333533 | 20535229767.213 |
| 12.5000000000002 | 20533855545.464 |
| 12.516666666666868 | 20532479431.466 |
| 12.533333333333536 | 20531101424.967 |
| 12.550000000000203 | 20529721525.712 |
| 12.56666666666687 | 20528339733.447 |
| 12.583333333333538 | 20526956047.917 |
| 12.600000000000206 | 20525570468.868 |
| 12.616666666666873 | 20524182996.044 |
| 12.63333333333354 | 20522793629.188 |
| 12.650000000000208 | 20521402368.046 |
| 12.666666666666876 | 20520009212.359 |
| 12.683333333333543 | 20518614161.872 |
| 12.70000000000021 | 20517217216.326 |
| 12.716666666666878 | 20515818375.463 |
| 12.733333333333546 | 20514417639.026 |
| 12.750000000000213 | 20513015006.756 |
| 12.76666666666688 | 20511610478.393 |
| 12.783333333333548 | 20510204053.678 |
| 12.800000000000216 | 20508795732.352 |
| 12.816666666666883 | 20507385514.153 |
| 12.83333333333355 | 20505973398.821 |
| 12.850000000000218 | 20504559386.096 |
| 12.866666666666886 | 20503143475.715 |
| 12.883333333333553 | 20501725667.416 |
| 12.90000000000022 | 20500305960.938 |
| 12.916666666666888 | 20498884356.018 |
| 12.933333333333556 | 20497460852.392 |
| 12.950000000000223 | 20496035449.796 |
| 12.96666666666689 | 20494608147.968 |
| 12.983333333333558 | 20493178946.642 |
| 13.000000000000226 | 20491747845.554 |
| 13.016666666666893 | 20490314844.439 |
| 13.03333333333356 | 20488879943.031 |
| 13.050000000000228 | 20487443141.063 |
| 13.066666666666896 | 20486004438.271 |
| 13.083333333333563 | 20484563834.386 |
| 13.10000000000023 | 20483121329.142 |
| 13.116666666666898 | 20481676922.27 |
| 13.133333333333566 | 20480230613.504 |
| 13.150000000000233 | 20478782402.574 |
| 13.1666666666669 | 20477332289.212 |
| 13.183333333333568 | 20475880273.148 |
| 13.200000000000236 | 20474426354.113 |
| 13.216666666666903 | 20472970531.837 |
| 13.23333333333357 | 20471512806.049 |
| 13.250000000000238 | 20470053176.478 |
| 13.266666666666906 | 20468591642.852 |
| 13.283333333333573 | 20467128204.901 |
| 13.30000000000024 | 20465662862.352 |
| 13.316666666666908 | 20464195614.933 |
| 13.333333333333576 | 20462726462.369 |
| 13.350000000000243 | 20461255404.389 |
| 13.36666666666691 | 20459782440.718 |
| 13.383333333333578 | 20458307571.083 |
| 13.400000000000245 | 20456830795.207 |
| 13.416666666666913 | 20455352112.817 |
| 13.43333333333358 | 20453871523.637 |
| 13.450000000000248 | 20452389027.391 |
| 13.466666666666915 | 20450904623.803 |
| 13.483333333333583 | 20449418312.596 |
| 13.50000000000025 | 20447930093.493 |
| 13.516666666666918 | 20446439966.216 |
| 13.533333333333585 | 20444947930.487 |
| 13.550000000000253 | 20443453986.029 |
| 13.56666666666692 | 20441958132.562 |
| 13.583333333333588 | 20440460369.807 |
| 13.600000000000255 | 20438960697.484 |
| 13.616666666666923 | 20437459115.314 |
| 13.63333333333359 | 20435955623.015 |
| 13.650000000000258 | 20434450220.308 |
| 13.666666666666925 | 20432942906.911 |
| 13.683333333333593 | 20431433682.541 |
| 13.70000000000026 | 20429922546.918 |
| 13.716666666666928 | 20428409499.757 |
| 13.733333333333595 | 20426894540.777 |
| 13.750000000000263 | 20425377669.695 |
| 13.76666666666693 | 20423858886.225 |
| 13.783333333333598 | 20422338190.084 |
| 13.800000000000265 | 20420815580.987 |
| 13.816666666666933 | 20419291058.649 |
| 13.8333333333336 | 20417764622.785 |
| 13.850000000000268 | 20416236273.109 |
| 13.866666666666935 | 20414706009.334 |
| 13.883333333333603 | 20413173831.174 |
| 13.90000000000027 | 20411639738.341 |
| 13.916666666666938 | 20410103730.547 |
| 13.933333333333605 | 20408565807.506 |
| 13.950000000000273 | 20407025968.927 |
| 13.96666666666694 | 20405484214.523 |
| 13.983333333333608 | 20403940544.004 |
| 14.000000000000275 | 20402394957.08 |
| 14.016666666666943 | 20400847453.461 |
| 14.03333333333361 | 20399298032.857 |
| 14.050000000000278 | 20397746694.976 |
| 14.066666666666945 | 20396193439.527 |
| 14.083333333333613 | 20394638266.218 |
| 14.10000000000028 | 20393081174.757 |
| 14.116666666666948 | 20391522164.851 |
| 14.133333333333615 | 20389961236.207 |
| 14.150000000000283 | 20388398388.531 |
| 14.16666666666695 | 20386833621.529 |
| 14.183333333333618 | 20385266934.907 |
| 14.200000000000285 | 20383698328.37 |
| 14.216666666666953 | 20382127801.623 |
| 14.23333333333362 | 20380555354.37 |
| 14.250000000000288 | 20378980986.314 |
| 14.266666666666955 | 20377404697.16 |
| 14.283333333333623 | 20375826486.609 |
| 14.30000000000029 | 20374246354.366 |
| 14.316666666666958 | 20372664300.13 |
| 14.333333333333625 | 20371080323.606 |
| 14.350000000000293 | 20369494424.493 |
| 14.36666666666696 | 20367906602.492 |
| 14.383333333333628 | 20366316857.305 |
| 14.400000000000295 | 20364725188.63 |
| 14.416666666666963 | 20363131596.167 |
| 14.43333333333363 | 20361536079.616 |
| 14.450000000000298 | 20359938638.675 |
| 14.466666666666965 | 20358339273.042 |
| 14.483333333333633 | 20356737982.414 |
| 14.5000000000003 | 20355134766.491 |
| 14.516666666666968 | 20353529624.967 |
| 14.533333333333635 | 20351922557.54 |
| 14.550000000000303 | 20350313563.906 |
| 14.56666666666697 | 20348702643.76 |
| 14.583333333333638 | 20347089796.798 |
| 14.600000000000305 | 20345475022.714 |
| 14.616666666666973 | 20343858321.202 |
| 14.63333333333364 | 20342239691.957 |
| 14.650000000000308 | 20340619134.671 |
| 14.666666666666975 | 20338996649.038 |
| 14.683333333333643 | 20337372234.75 |
| 14.70000000000031 | 20335745891.499 |
| 14.716666666666978 | 20334117618.978 |
| 14.733333333333645 | 20332487416.876 |
| 14.750000000000313 | 20330855284.885 |
| 14.76666666666698 | 20329221222.696 |
| 14.783333333333648 | 20327585229.998 |
| 14.800000000000315 | 20325947306.48 |
| 14.816666666666983 | 20324307451.832 |
| 14.83333333333365 | 20322665665.742 |
| 14.850000000000318 | 20321021947.898 |
| 14.866666666666985 | 20319376297.988 |
| 14.883333333333653 | 20317728715.699 |
| 14.90000000000032 | 20316079200.718 |
| 14.916666666666988 | 20314427752.732 |
| 14.933333333333655 | 20312774371.425 |
| 14.950000000000323 | 20311119056.484 |
| 14.96666666666699 | 20309461807.594 |
| 14.983333333333658 | 20307802624.439 |
| 15.000000000000325 | 20306141506.704 |
| 15.016666666666993 | 20304478454.071 |
| 15.03333333333366 | 20302813466.224 |
| 15.050000000000328 | 20301146542.847 |
| 15.066666666666995 | 20299477683.621 |
| 15.083333333333663 | 20297806888.228 |
| 15.10000000000033 | 20296134156.349 |
| 15.116666666666998 | 20294459487.667 |
| 15.133333333333665 | 20292782881.86 |
| 15.150000000000333 | 20291104338.61 |
| 15.166666666667 | 20289423857.596 |
| 15.183333333333668 | 20287741438.496 |
| 15.200000000000335 | 20286057080.991 |
| 15.216666666667003 | 20284370784.758 |
| 15.23333333333367 | 20282682549.474 |
| 15.250000000000338 | 20280992374.818 |
| 15.266666666667005 | 20279300260.467 |
| 15.283333333333672 | 20277606206.096 |
| 15.30000000000034 | 20275910211.382 |
| 15.316666666667007 | 20274212276 |
| 15.333333333333675 | 20272512399.626 |
| 15.350000000000342 | 20270810581.934 |
| 15.36666666666701 | 20269106822.599 |
| 15.383333333333677 | 20267401121.294 |
| 15.400000000000345 | 20265693477.692 |
| 15.416666666667012 | 20263983891.467 |
| 15.43333333333368 | 20262272362.29 |
| 15.450000000000347 | 20260558889.835 |
| 15.466666666667015 | 20258843473.771 |
| 15.483333333333682 | 20257126113.771 |
| 15.50000000000035 | 20255406809.504 |
| 15.516666666667017 | 20253685560.642 |
| 15.533333333333685 | 20251962366.853 |
| 15.550000000000352 | 20250237227.807 |
| 15.56666666666702 | 20248510143.173 |
| 15.583333333333687 | 20246781112.618 |
| 15.600000000000355 | 20245050135.812 |
| 15.616666666667022 | 20243317212.42 |
| 15.63333333333369 | 20241582342.11 |
| 15.650000000000357 | 20239845524.549 |
| 15.666666666667025 | 20238106759.402 |
| 15.683333333333692 | 20236366046.335 |
| 15.70000000000036 | 20234623385.014 |
| 15.716666666667027 | 20232878775.102 |
| 15.733333333333695 | 20231132216.263 |
| 15.750000000000362 | 20229383708.163 |
| 15.76666666666703 | 20227633250.463 |
| 15.783333333333697 | 20225880842.826 |
| 15.800000000000365 | 20224126484.915 |
| 15.816666666667032 | 20222370176.392 |
| 15.8333333333337 | 20220611916.918 |
| 15.850000000000367 | 20218851706.153 |
| 15.866666666667035 | 20217089543.759 |
| 15.883333333333702 | 20215325429.395 |
| 15.90000000000037 | 20213559362.722 |
| 15.916666666667037 | 20211791343.396 |
| 15.933333333333705 | 20210021371.079 |
| 15.950000000000372 | 20208249445.426 |
| 15.96666666666704 | 20206475566.097 |
| 15.983333333333707 | 20204699732.749 |
| 16.000000000000373 | 20202921945.037 |
| 16.01666666666704 | 20201142202.618 |
| 16.033333333333704 | 20199360505.149 |
| 16.05000000000037 | 20197576852.284 |
| 16.066666666667036 | 20195791243.678 |
| 16.0833333333337 | 20194003678.985 |
| 16.100000000000367 | 20192214157.86 |
| 16.116666666667033 | 20190422679.956 |
| 16.1333333333337 | 20188629244.926 |
| 16.150000000000365 | 20186833852.421 |
| 16.16666666666703 | 20185036502.095 |
| 16.183333333333696 | 20183237193.599 |
| 16.20000000000036 | 20181435926.583 |
| 16.216666666667027 | 20179632700.699 |
| 16.233333333333693 | 20177827515.596 |
| 16.25000000000036 | 20176020370.925 |
| 16.266666666667025 | 20174211266.334 |
| 16.28333333333369 | 20172400201.471 |
| 16.300000000000356 | 20170587175.986 |
| 16.31666666666702 | 20168772189.526 |
| 16.333333333333687 | 20166955241.738 |
| 16.350000000000353 | 20165136332.268 |
| 16.36666666666702 | 20163315460.764 |
| 16.383333333333685 | 20161492626.871 |
| 16.40000000000035 | 20159667830.235 |
| 16.416666666667016 | 20157841070.5 |
| 16.43333333333368 | 20156012347.31 |
| 16.450000000000347 | 20154181660.31 |
| 16.466666666667013 | 20152349009.143 |
| 16.48333333333368 | 20150514393.452 |
| 16.500000000000345 | 20148677812.879 |
| 16.51666666666701 | 20146839267.067 |
| 16.533333333333676 | 20144998755.656 |
| 16.55000000000034 | 20143156278.289 |
| 16.566666666667007 | 20141311834.605 |
| 16.583333333333673 | 20139465424.244 |
| 16.60000000000034 | 20137617046.847 |
| 16.616666666667005 | 20135766702.052 |
| 16.63333333333367 | 20133914389.497 |
| 16.650000000000336 | 20132060108.822 |
| 16.666666666667002 | 20130203859.663 |
| 16.683333333333668 | 20128345641.658 |
| 16.700000000000333 | 20126485454.443 |
| 16.716666666667 | 20124623297.655 |
| 16.733333333333665 | 20122759170.929 |
| 16.75000000000033 | 20120893073.901 |
| 16.766666666666996 | 20119025006.205 |
| 16.783333333333662 | 20117154967.475 |
| 16.800000000000328 | 20115282957.346 |
| 16.816666666666993 | 20113408975.45 |
| 16.83333333333366 | 20111533021.42 |
| 16.850000000000325 | 20109655094.889 |
| 16.86666666666699 | 20107775195.488 |
| 16.883333333333656 | 20105893322.849 |
| 16.900000000000322 | 20104009476.602 |
| 16.916666666666988 | 20102123656.378 |
| 16.933333333333653 | 20100235861.806 |
| 16.95000000000032 | 20098346092.517 |
| 16.966666666666985 | 20096454348.138 |
| 16.98333333333365 | 20094560628.298 |
| 17.000000000000316 | 20092664932.626 |
| 17.016666666666982 | 20090767260.747 |
| 17.033333333333648 | 20088867612.29 |
| 17.050000000000313 | 20086965986.88 |
| 17.06666666666698 | 20085062384.144 |
| 17.083333333333645 | 20083156803.707 |
| 17.10000000000031 | 20081249245.193 |
| 17.116666666666976 | 20079339708.228 |
| 17.133333333333642 | 20077428192.434 |
| 17.150000000000308 | 20075514697.436 |
| 17.166666666666973 | 20073599222.857 |
| 17.18333333333364 | 20071681768.318 |
| 17.200000000000305 | 20069762333.441 |
| 17.21666666666697 | 20067840917.849 |
| 17.233333333333636 | 20065917521.161 |
| 17.250000000000302 | 20063992142.999 |
| 17.266666666666968 | 20062064782.982 |
| 17.283333333333633 | 20060135440.73 |
| 17.3000000000003 | 20058204115.862 |
| 17.316666666666965 | 20056270807.995 |
| 17.33333333333363 | 20054335516.748 |
| 17.350000000000296 | 20052398241.738 |
| 17.366666666666962 | 20050458982.583 |
| 17.383333333333628 | 20048517738.897 |
| 17.400000000000293 | 20046574510.299 |
| 17.41666666666696 | 20044629296.402 |
| 17.433333333333625 | 20042682096.822 |
| 17.45000000000029 | 20040732911.172 |
| 17.466666666666956 | 20038781739.068 |
| 17.483333333333622 | 20036828580.122 |
| 17.500000000000288 | 20034873433.947 |
| 17.516666666666953 | 20032916300.155 |
| 17.53333333333362 | 20030957178.359 |
| 17.550000000000285 | 20028996068.169 |
| 17.56666666666695 | 20027032969.196 |
| 17.583333333333616 | 20025067881.051 |
| 17.600000000000282 | 20023100803.344 |
| 17.616666666666948 | 20021131735.684 |
| 17.633333333333614 | 20019160677.679 |
| 17.65000000000028 | 20017187628.938 |
| 17.666666666666945 | 20015212589.068 |
| 17.68333333333361 | 20013235557.677 |
| 17.700000000000276 | 20011256534.372 |
| 17.716666666666942 | 20009275518.759 |
| 17.733333333333608 | 20007292510.443 |
| 17.750000000000274 | 20005307509.03 |
| 17.76666666666694 | 20003320514.124 |
| 17.783333333333605 | 20001331525.329 |
| 17.80000000000027 | 19999340542.25 |
| 17.816666666666936 | 19997347564.489 |
| 17.833333333333602 | 19995352591.649 |
| 17.850000000000268 | 19993355623.331 |
| 17.866666666666934 | 19991356659.139 |
| 17.8833333333336 | 19989355698.671 |
| 17.900000000000265 | 19987352741.53 |
| 17.91666666666693 | 19985347787.315 |
| 17.933333333333596 | 19983340835.626 |
| 17.950000000000262 | 19981331886.062 |
| 17.966666666666928 | 19979320938.22 |
| 17.983333333333594 | 19977307991.7 |
| 18.00000000000026 | 19975293046.098 |
| 18.016666666666925 | 19973276101.011 |
| 18.03333333333359 | 19971257156.036 |
| 18.050000000000257 | 19969236210.769 |
| 18.066666666666922 | 19967213264.805 |
| 18.083333333333588 | 19965188317.738 |
| 18.100000000000254 | 19963161369.163 |
| 18.11666666666692 | 19961132418.674 |
| 18.133333333333585 | 19959101465.864 |
| 18.15000000000025 | 19957068510.326 |
| 18.166666666666917 | 19955033551.652 |
| 18.183333333333582 | 19952996589.433 |
| 18.200000000000248 | 19950957623.261 |
| 18.216666666666914 | 19948916652.726 |
| 18.23333333333358 | 19946873677.418 |
| 18.250000000000245 | 19944828696.927 |
| 18.26666666666691 | 19942781710.843 |
| 18.283333333333577 | 19940732718.752 |
| 18.300000000000242 | 19938681720.244 |
| 18.316666666666908 | 19936628714.905 |
| 18.333333333333574 | 19934573702.323 |
| 18.35000000000024 | 19932516682.084 |
| 18.366666666666905 | 19930457653.774 |
| 18.38333333333357 | 19928396616.978 |
| 18.400000000000237 | 19926333571.281 |
| 18.416666666666902 | 19924268516.267 |
| 18.433333333333568 | 19922201451.52 |
| 18.450000000000234 | 19920132376.622 |
| 18.4666666666669 | 19918061291.157 |
| 18.483333333333565 | 19915988194.707 |
| 18.50000000000023 | 19913913086.853 |
| 18.516666666666897 | 19911835967.176 |
| 18.533333333333562 | 19909756835.257 |
| 18.550000000000228 | 19907675690.675 |
| 18.566666666666894 | 19905592533.01 |
| 18.58333333333356 | 19903507361.841 |
| 18.600000000000225 | 19901420176.747 |
| 18.61666666666689 | 19899330977.304 |
| 18.633333333333557 | 19897239763.09 |
| 18.650000000000222 | 19895146533.683 |
| 18.666666666666888 | 19893051288.657 |
| 18.683333333333554 | 19890954027.589 |
| 18.70000000000022 | 19888854750.053 |
| 18.716666666666885 | 19886753455.625 |
| 18.73333333333355 | 19884650143.878 |
| 18.750000000000217 | 19882544814.386 |
| 18.766666666666882 | 19880437466.721 |
| 18.783333333333548 | 19878328100.457 |
| 18.800000000000214 | 19876216715.164 |
| 18.81666666666688 | 19874103310.413 |
| 18.833333333333545 | 19871987885.777 |
| 18.85000000000021 | 19869870440.824 |
| 18.866666666666877 | 19867750975.125 |
| 18.883333333333542 | 19865629488.248 |
| 18.900000000000208 | 19863505979.763 |
| 18.916666666666874 | 19861380449.236 |
| 18.93333333333354 | 19859252896.236 |
| 18.950000000000205 | 19857123320.329 |
| 18.96666666666687 | 19854991721.081 |
| 18.983333333333537 | 19852858098.059 |
| 19.000000000000203 | 19850722450.827 |
| 19.01666666666687 | 19848584778.951 |
| 19.033333333333534 | 19846445081.994 |
| 19.0500000000002 | 19844303359.52 |
| 19.066666666666865 | 19842159611.091 |
| 19.08333333333353 | 19840013836.271 |
| 19.100000000000197 | 19837866034.621 |
| 19.116666666666863 | 19835716205.703 |
| 19.13333333333353 | 19833564349.077 |
| 19.150000000000194 | 19831410464.303 |
| 19.16666666666686 | 19829254550.941 |
| 19.183333333333525 | 19827096608.551 |
| 19.20000000000019 | 19824936636.69 |
| 19.216666666666857 | 19822774634.917 |
| 19.233333333333523 | 19820610602.79 |
| 19.25000000000019 | 19818444539.864 |
| 19.266666666666854 | 19816276445.697 |
| 19.28333333333352 | 19814106319.843 |
| 19.300000000000185 | 19811934161.859 |
| 19.31666666666685 | 19809759971.299 |
| 19.333333333333517 | 19807583747.716 |
| 19.350000000000183 | 19805405490.665 |
| 19.36666666666685 | 19803225199.698 |
| 19.383333333333514 | 19801042874.368 |
| 19.40000000000018 | 19798858514.226 |
| 19.416666666666845 | 19796672118.824 |
| 19.43333333333351 | 19794483687.712 |
| 19.450000000000177 | 19792293220.44 |
| 19.466666666666843 | 19790100716.558 |
| 19.48333333333351 | 19787906175.615 |
| 19.500000000000174 | 19785709597.159 |
| 19.51666666666684 | 19783510980.738 |
| 19.533333333333506 | 19781310325.9 |
| 19.55000000000017 | 19779107632.19 |
| 19.566666666666837 | 19776902899.155 |
| 19.583333333333503 | 19774696126.341 |
| 19.60000000000017 | 19772487313.292 |
| 19.616666666666834 | 19770276459.553 |
| 19.6333333333335 | 19768063564.667 |
| 19.650000000000166 | 19765848628.179 |
| 19.66666666666683 | 19763631649.63 |
| 19.683333333333497 | 19761412628.562 |
| 19.700000000000163 | 19759191564.518 |
| 19.71666666666683 | 19756968457.037 |
| 19.733333333333494 | 19754743305.661 |
| 19.75000000000016 | 19752516109.929 |
| 19.766666666666826 | 19750286869.381 |
| 19.78333333333349 | 19748055583.554 |
| 19.800000000000157 | 19745822251.987 |
| 19.816666666666823 | 19743586874.218 |
| 19.83333333333349 | 19741349449.783 |
| 19.850000000000154 | 19739109978.218 |
| 19.86666666666682 | 19736868459.06 |
| 19.883333333333486 | 19734624891.843 |
| 19.90000000000015 | 19732379276.102 |
| 19.916666666666817 | 19730131611.37 |
| 19.933333333333483 | 19727881897.182 |
| 19.95000000000015 | 19725630133.071 |
| 19.966666666666814 | 19723376318.567 |
| 19.98333333333348 | 19721120453.203 |
| 20.000000000000146 | 19718862536.51 |
| 20.01666666666681 | 19716602568.018 |
| 20.033333333333477 | 19714340547.257 |
| 20.050000000000143 | 19712076473.757 |
| 20.06666666666681 | 19709810347.046 |
| 20.083333333333474 | 19707542166.652 |
| 20.10000000000014 | 19705271932.103 |
| 20.116666666666806 | 19702999642.925 |
| 20.13333333333347 | 19700725298.645 |
| 20.150000000000137 | 19698448898.788 |
| 20.166666666666803 | 19696170442.88 |
| 20.18333333333347 | 19693889930.446 |
| 20.200000000000134 | 19691607361.008 |
| 20.2166666666668 | 19689322734.091 |
| 20.233333333333466 | 19687036049.218 |
| 20.25000000000013 | 19684747305.909 |
| 20.266666666666797 | 19682456503.688 |
| 20.283333333333463 | 19680163642.074 |
| 20.30000000000013 | 19677868720.588 |
| 20.316666666666794 | 19675571738.751 |
| 20.33333333333346 | 19673272696.08 |
| 20.350000000000126 | 19670971592.095 |
| 20.36666666666679 | 19668668426.314 |
| 20.383333333333457 | 19666363198.254 |
| 20.400000000000123 | 19664055907.432 |
| 20.41666666666679 | 19661746553.363 |
| 20.433333333333454 | 19659435135.564 |
| 20.45000000000012 | 19657121653.549 |
| 20.466666666666786 | 19654806106.832 |
| 20.48333333333345 | 19652488494.928 |
| 20.500000000000117 | 19650168817.35 |
| 20.516666666666783 | 19647847073.61 |
| 20.53333333333345 | 19645523263.219 |
| 20.550000000000114 | 19643197385.69 |
| 20.56666666666678 | 19640869440.533 |
| 20.583333333333446 | 19638539427.258 |
| 20.60000000000011 | 19636207345.374 |
| 20.616666666666777 | 19633873194.391 |
| 20.633333333333443 | 19631536973.816 |
| 20.65000000000011 | 19629198683.158 |
| 20.666666666666774 | 19626858321.923 |
| 20.68333333333344 | 19624515889.617 |
| 20.700000000000106 | 19622171385.747 |
| 20.71666666666677 | 19619824809.818 |
| 20.733333333333437 | 19617476161.334 |
| 20.750000000000103 | 19615125439.8 |
| 20.76666666666677 | 19612772644.717 |
| 20.783333333333434 | 19610417775.591 |
| 20.8000000000001 | 19608060831.921 |
| 20.816666666666766 | 19605701813.21 |
| 20.83333333333343 | 19603340718.96 |
| 20.850000000000097 | 19600977548.669 |
| 20.866666666666763 | 19598612301.838 |
| 20.88333333333343 | 19596244977.965 |
| 20.900000000000095 | 19593875576.549 |
| 20.91666666666676 | 19591504097.089 |
| 20.933333333333426 | 19589130539.08 |
| 20.95000000000009 | 19586754902.019 |
| 20.966666666666757 | 19584377185.403 |
| 20.983333333333423 | 19581997388.727 |
| 21.00000000000009 | 19579615511.485 |
| 21.016666666666755 | 19577231553.171 |
| 21.03333333333342 | 19574845513.278 |
| 21.050000000000086 | 19572457391.3 |
| 21.06666666666675 | 19570067186.729 |
| 21.083333333333417 | 19567674899.056 |
| 21.100000000000083 | 19565280527.772 |
| 21.11666666666675 | 19562884072.366 |
| 21.133333333333415 | 19560485532.33 |
| 21.15000000000008 | 19558084907.151 |
| 21.166666666666746 | 19555682196.319 |
| 21.18333333333341 | 19553277399.32 |
| 21.200000000000077 | 19550870515.642 |
| 21.216666666666743 | 19548461544.772 |
| 21.23333333333341 | 19546050486.194 |
| 21.250000000000075 | 19543637339.395 |
| 21.26666666666674 | 19541222103.859 |
| 21.283333333333406 | 19538804779.07 |
| 21.30000000000007 | 19536385364.51 |
| 21.316666666666737 | 19533963859.664 |
| 21.333333333333403 | 19531540264.012 |
| 21.35000000000007 | 19529114577.036 |
| 21.366666666666735 | 19526686798.216 |
| 21.3833333333334 | 19524256927.034 |
| 21.400000000000066 | 19521824962.967 |
| 21.416666666666732 | 19519390905.496 |
| 21.433333333333398 | 19516954754.097 |
| 21.450000000000063 | 19514516508.249 |
| 21.46666666666673 | 19512076167.429 |
| 21.483333333333395 | 19509633731.112 |
| 21.50000000000006 | 19507189198.774 |
| 21.516666666666726 | 19504742569.89 |
| 21.533333333333392 | 19502293843.935 |
| 21.550000000000058 | 19499843020.381 |
| 21.566666666666723 | 19497390098.703 |
| 21.58333333333339 | 19494935078.371 |
| 21.600000000000055 | 19492477958.858 |
| 21.61666666666672 | 19490018739.635 |
| 21.633333333333386 | 19487557420.173 |
| 21.650000000000052 | 19485093999.94 |
| 21.666666666666718 | 19482628478.406 |
| 21.683333333333383 | 19480160855.039 |
| 21.70000000000005 | 19477691129.308 |
| 21.716666666666715 | 19475219300.678 |
| 21.73333333333338 | 19472745368.617 |
| 21.750000000000046 | 19470269332.591 |
| 21.766666666666712 | 19467791192.063 |
| 21.783333333333378 | 19465310946.5 |
| 21.800000000000043 | 19462828595.364 |
| 21.81666666666671 | 19460344138.119 |
| 21.833333333333375 | 19457857574.227 |
| 21.85000000000004 | 19455368903.15 |
| 21.866666666666706 | 19452878124.35 |
| 21.883333333333372 | 19450385237.286 |
| 21.900000000000038 | 19447890241.418 |
| 21.916666666666703 | 19445393136.206 |
| 21.93333333333337 | 19442893921.108 |
| 21.950000000000035 | 19440392595.582 |
| 21.9666666666667 | 19437889159.085 |
| 21.983333333333366 | 19435383611.074 |
| 22.000000000000032 | 19432875951.003 |
| 22.016666666666698 | 19430366178.33 |
| 22.033333333333363 | 19427854292.507 |
| 22.05000000000003 | 19425340292.989 |
| 22.066666666666695 | 19422824179.229 |
| 22.08333333333336 | 19420305950.679 |
| 22.100000000000026 | 19417785606.791 |
| 22.116666666666692 | 19415263147.016 |
| 22.133333333333358 | 19412738570.805 |
| 22.150000000000023 | 19410211877.608 |
| 22.16666666666669 | 19407683066.873 |
| 22.183333333333355 | 19405152138.048 |
| 22.20000000000002 | 19402619090.583 |
| 22.216666666666686 | 19400083923.923 |
| 22.233333333333352 | 19397546637.515 |
| 22.250000000000018 | 19395007230.804 |
| 22.266666666666683 | 19392465703.237 |
| 22.28333333333335 | 19389922054.256 |
| 22.300000000000015 | 19387376283.306 |
| 22.31666666666668 | 19384828389.83 |
| 22.333333333333346 | 19382278373.269 |
| 22.350000000000012 | 19379726233.066 |
| 22.366666666666678 | 19377171968.662 |
| 22.383333333333344 | 19374615579.496 |
| 22.40000000000001 | 19372057065.008 |
| 22.416666666666675 | 19369496424.637 |
| 22.43333333333334 | 19366933657.821 |
| 22.450000000000006 | 19364368763.998 |
| 22.466666666666672 | 19361801742.604 |
| 22.483333333333338 | 19359232593.076 |
| 22.500000000000004 | 19356661314.848 |
| 22.51666666666667 | 19354087907.356 |
| 22.533333333333335 | 19351512370.034 |
| 22.55 | 19348934702.314 |
| 22.566666666666666 | 19346354903.63 |
| 22.583333333333332 | 19343772973.413 |
| 22.599999999999998 | 19341188911.095 |
| 22.616666666666664 | 19338602716.105 |
| 22.63333333333333 | 19336014387.875 |
| 22.649999999999995 | 19333423925.833 |
| 22.66666666666666 | 19330831329.407 |
| 22.683333333333326 | 19328236598.025 |
| 22.699999999999992 | 19325639731.115 |
| 22.716666666666658 | 19323040728.102 |
| 22.733333333333324 | 19320439588.412 |
| 22.74999999999999 | 19317836311.47 |
| 22.766666666666655 | 19315230896.7 |
| 22.78333333333332 | 19312623343.526 |
| 22.799999999999986 | 19310013651.371 |
| 22.816666666666652 | 19307401819.656 |
| 22.833333333333318 | 19304787847.803 |
| 22.849999999999984 | 19302171735.233 |
| 22.86666666666665 | 19299553481.366 |
| 22.883333333333315 | 19296933085.62 |
| 22.89999999999998 | 19294310547.415 |
| 22.916666666666647 | 19291685866.168 |
| 22.933333333333312 | 19289059041.296 |
| 22.949999999999978 | 19286430072.215 |
| 22.966666666666644 | 19283798958.343 |
| 22.98333333333331 | 19281165699.092 |
| 22.999999999999975 | 19278530293.878 |
| 23.01666666666664 | 19275892742.114 |
| 23.033333333333307 | 19273253043.213 |
| 23.049999999999972 | 19270611196.588 |
| 23.066666666666638 | 19267967201.648 |
| 23.083333333333304 | 19265321057.805 |
| 23.09999999999997 | 19262672764.47 |
| 23.116666666666635 | 19260022321.05 |
| 23.1333333333333 | 19257369726.955 |
| 23.149999999999967 | 19254714981.593 |
| 23.166666666666632 | 19252058084.369 |
| 23.183333333333298 | 19249399034.692 |
| 23.199999999999964 | 19246737831.966 |
| 23.21666666666663 | 19244074475.596 |
| 23.233333333333295 | 19241408964.986 |
| 23.24999999999996 | 19238741299.539 |
| 23.266666666666627 | 19236071478.659 |
| 23.283333333333292 | 19233399501.748 |
| 23.299999999999958 | 19230725368.205 |
| 23.316666666666624 | 19228049077.433 |
| 23.33333333333329 | 19225370628.83 |
| 23.349999999999955 | 19222690021.795 |
| 23.36666666666662 | 19220007255.728 |
| 23.383333333333287 | 19217322330.024 |
| 23.399999999999952 | 19214635244.082 |
| 23.416666666666618 | 19211945997.297 |
| 23.433333333333284 | 19209254589.065 |
| 23.44999999999995 | 19206561018.779 |
| 23.466666666666615 | 19203865285.835 |
| 23.48333333333328 | 19201167389.624 |
| 23.499999999999947 | 19198467329.54 |
| 23.516666666666612 | 19195765104.973 |
| 23.533333333333278 | 19193060715.315 |
| 23.549999999999944 | 19190354159.956 |
| 23.56666666666661 | 19187645438.285 |
| 23.583333333333275 | 19184934549.691 |
| 23.59999999999994 | 19182221493.562 |
| 23.616666666666607 | 19179506269.284 |
| 23.633333333333272 | 19176788876.244 |
| 23.649999999999938 | 19174069313.828 |
| 23.666666666666604 | 19171347581.421 |
| 23.68333333333327 | 19168623678.406 |
| 23.699999999999935 | 19165897604.167 |
| 23.7166666666666 | 19163169358.087 |
| 23.733333333333267 | 19160438939.548 |
| 23.749999999999932 | 19157706347.93 |
| 23.766666666666598 | 19154971582.613 |
| 23.783333333333264 | 19152234642.979 |
| 23.79999999999993 | 19149495528.404 |
| 23.816666666666595 | 19146754238.268 |
| 23.83333333333326 | 19144010771.947 |
| 23.849999999999927 | 19141265128.818 |
| 23.866666666666593 | 19138517308.258 |
| 23.88333333333326 | 19135767309.64 |
| 23.899999999999924 | 19133015132.339 |
| 23.91666666666659 | 19130260775.729 |
| 23.933333333333255 | 19127504239.182 |
| 23.94999999999992 | 19124745522.07 |
| 23.966666666666587 | 19121984623.764 |
| 23.983333333333253 | 19119221543.635 |
| 23.99999999999992 | 19116456281.053 |
| 24.016666666666584 | 19113688835.385 |
| 24.03333333333325 | 19110919206.001 |
| 24.049999999999915 | 19108147392.268 |
| 24.06666666666658 | 19105373393.552 |
| 24.083333333333247 | 19102597209.218 |
| 24.099999999999913 | 19099818838.633 |
| 24.11666666666658 | 19097038281.159 |
| 24.133333333333244 | 19094255536.161 |
| 24.14999999999991 | 19091470603.001 |
| 24.166666666666575 | 19088683481.041 |
| 24.18333333333324 | 19085894169.642 |
| 24.199999999999907 | 19083102668.164 |
| 24.216666666666573 | 19080308975.967 |
| 24.23333333333324 | 19077513092.41 |
| 24.249999999999904 | 19074715016.85 |
| 24.26666666666657 | 19071914748.646 |
| 24.283333333333236 | 19069112287.152 |
| 24.2999999999999 | 19066307631.724 |
| 24.316666666666567 | 19063500781.719 |
| 24.333333333333233 | 19060691736.488 |
| 24.3499999999999 | 19057880495.387 |
| 24.366666666666564 | 19055067057.766 |
| 24.38333333333323 | 19052251422.979 |
| 24.399999999999896 | 19049433590.374 |
| 24.41666666666656 | 19046613559.304 |
| 24.433333333333227 | 19043791329.116 |
| 24.449999999999893 | 19040966899.16 |
| 24.46666666666656 | 19038140268.782 |
| 24.483333333333224 | 19035311437.331 |
| 24.49999999999989 | 19032480404.151 |
| 24.516666666666556 | 19029647168.588 |
| 24.53333333333322 | 19026811729.987 |
| 24.549999999999887 | 19023974087.692 |
| 24.566666666666553 | 19021134241.044 |
| 24.58333333333322 | 19018292189.386 |
| 24.599999999999884 | 19015447932.06 |
| 24.61666666666655 | 19012601468.405 |
| 24.633333333333216 | 19009752797.762 |
| 24.64999999999988 | 19006901919.469 |
| 24.666666666666547 | 19004048832.864 |
| 24.683333333333213 | 19001193537.285 |
| 24.69999999999988 | 18998336032.067 |
| 24.716666666666544 | 18995476316.547 |
| 24.73333333333321 | 18992614390.058 |
| 24.749999999999876 | 18989750251.936 |
| 24.76666666666654 | 18986883901.513 |
| 24.783333333333207 | 18984015338.121 |
| 24.799999999999873 | 18981144561.092 |
| 24.81666666666654 | 18978271569.756 |
| 24.833333333333204 | 18975396363.444 |
| 24.84999999999987 | 18972518941.484 |
| 24.866666666666536 | 18969639303.205 |
| 24.8833333333332 | 18966757447.934 |
| 24.899999999999867 | 18963873374.998 |
| 24.916666666666533 | 18960987083.721 |
| 24.9333333333332 | 18958098573.43 |
| 24.949999999999864 | 18955207843.448 |
| 24.96666666666653 | 18952314893.098 |
| 24.983333333333196 | 18949419721.704 |
| 24.99999999999986 | 18946522328.585 |
| 25.016666666666527 | 18943622713.064 |
| 25.033333333333193 | 18940720874.46 |
| 25.04999999999986 | 18937816812.092 |
| 25.066666666666524 | 18934910525.279 |
| 25.08333333333319 | 18932002013.337 |
| 25.099999999999856 | 18929091275.584 |
| 25.11666666666652 | 18926178311.335 |
| 25.133333333333187 | 18923263119.905 |
| 25.149999999999853 | 18920345700.608 |
| 25.16666666666652 | 18917426052.757 |
| 25.183333333333184 | 18914504175.665 |
| 25.19999999999985 | 18911580068.644 |
| 25.216666666666516 | 18908653731.003 |
| 25.23333333333318 | 18905725162.052 |
| 25.249999999999847 | 18902794361.102 |
| 25.266666666666513 | 18899861327.459 |
| 25.28333333333318 | 18896926060.431 |
| 25.299999999999844 | 18893988559.325 |
| 25.31666666666651 | 18891048823.446 |
| 25.333333333333176 | 18888106852.099 |
| 25.34999999999984 | 18885162644.588 |
| 25.366666666666507 | 18882216200.216 |
| 25.383333333333173 | 18879267518.284 |
| 25.39999999999984 | 18876316598.095 |
| 25.416666666666504 | 18873363438.948 |
| 25.43333333333317 | 18870408040.144 |
| 25.449999999999836 | 18867450400.98 |
| 25.4666666666665 | 18864490520.756 |
| 25.483333333333167 | 18861528398.768 |
| 25.499999999999833 | 18858564034.312 |
| 25.5166666666665 | 18855597426.683 |
| 25.533333333333164 | 18852628575.175 |
| 25.54999999999983 | 18849657479.084 |
| 25.566666666666496 | 18846684137.7 |
| 25.58333333333316 | 18843708550.316 |
| 25.599999999999827 | 18840730716.223 |
| 25.616666666666493 | 18837750634.71 |
| 25.63333333333316 | 18834768305.068 |
| 25.649999999999824 | 18831783726.584 |
| 25.66666666666649 | 18828796898.546 |
| 25.683333333333156 | 18825807820.24 |
| 25.69999999999982 | 18822816490.952 |
| 25.716666666666487 | 18819822909.967 |
| 25.733333333333153 | 18816827076.569 |
| 25.74999999999982 | 18813828990.041 |
| 25.766666666666485 | 18810828649.665 |
| 25.78333333333315 | 18807826054.722 |
| 25.799999999999816 | 18804821204.493 |
| 25.81666666666648 | 18801814098.258 |
| 25.833333333333147 | 18798804735.294 |
| 25.849999999999813 | 18795793114.879 |
| 25.86666666666648 | 18792779236.292 |
| 25.883333333333145 | 18789763098.806 |
| 25.89999999999981 | 18786744701.699 |
| 25.916666666666476 | 18783724044.243 |
| 25.93333333333314 | 18780701125.712 |
| 25.949999999999807 | 18777675945.378 |
| 25.966666666666473 | 18774648502.513 |
| 25.98333333333314 | 18771618796.388 |
| 25.999999999999805 | 18768586826.272 |
| 26.01666666666647 | 18765552591.434 |
| 26.033333333333136 | 18762516091.141 |
| 26.0499999999998 | 18759477324.662 |
| 26.066666666666467 | 18756436291.262 |
| 26.083333333333133 | 18753392990.206 |
| 26.0999999999998 | 18750347420.758 |
| 26.116666666666465 | 18747299582.182 |
| 26.13333333333313 | 18744249473.74 |
| 26.149999999999796 | 18741197094.695 |
| 26.166666666666462 | 18738142444.305 |
| 26.183333333333128 | 18735085521.833 |
| 26.199999999999793 | 18732026326.535 |
| 26.21666666666646 | 18728964857.67 |
| 26.233333333333125 | 18725901114.495 |
| 26.24999999999979 | 18722835096.266 |
| 26.266666666666456 | 18719766802.238 |
| 26.283333333333122 | 18716696231.666 |
| 26.299999999999788 | 18713623383.802 |
| 26.316666666666453 | 18710548257.9 |
| 26.33333333333312 | 18707470853.21 |
| 26.349999999999785 | 18704391168.984 |
| 26.36666666666645 | 18701309204.47 |
| 26.383333333333116 | 18698224958.918 |
| 26.399999999999782 | 18695138431.575 |
| 26.416666666666448 | 18692049621.688 |
| 26.433333333333113 | 18688958528.503 |
| 26.44999999999978 | 18685865151.265 |
| 26.466666666666445 | 18682769489.219 |
| 26.48333333333311 | 18679671541.606 |
| 26.499999999999776 | 18676571307.67 |
| 26.516666666666442 | 18673468786.651 |
| 26.533333333333108 | 18670363977.791 |
| 26.549999999999773 | 18667256880.327 |
| 26.56666666666644 | 18664147493.499 |
| 26.583333333333105 | 18661035816.544 |
| 26.59999999999977 | 18657921848.699 |
| 26.616666666666436 | 18654805589.2 |
| 26.633333333333102 | 18651687037.28 |
| 26.649999999999768 | 18648566192.174 |
| 26.666666666666433 | 18645443053.114 |
| 26.6833333333331 | 18642317619.332 |
| 26.699999999999765 | 18639189890.059 |
| 26.71666666666643 | 18636059864.526 |
| 26.733333333333096 | 18632927541.96 |
| 26.749999999999762 | 18629792921.59 |
| 26.766666666666428 | 18626656002.643 |
| 26.783333333333093 | 18623516784.344 |
| 26.79999999999976 | 18620375265.92 |
| 26.816666666666425 | 18617231446.594 |
| 26.83333333333309 | 18614085325.59 |
| 26.849999999999756 | 18610936902.129 |
| 26.866666666666422 | 18607786175.433 |
| 26.883333333333088 | 18604633144.723 |
| 26.899999999999753 | 18601477809.217 |
| 26.91666666666642 | 18598320168.134 |
| 26.933333333333085 | 18595160220.691 |
| 26.94999999999975 | 18591997966.105 |
| 26.966666666666416 | 18588833403.591 |
| 26.983333333333082 | 18585666532.364 |
| 26.999999999999748 | 18582497351.637 |
| 27.016666666666413 | 18579325860.623 |
| 27.03333333333308 | 18576152058.533 |
| 27.049999999999745 | 18572975944.578 |
| 27.06666666666641 | 18569797517.968 |
| 27.083333333333076 | 18566616777.91 |
| 27.099999999999742 | 18563433723.614 |
| 27.116666666666408 | 18560248354.285 |
| 27.133333333333074 | 18557060669.128 |
| 27.14999999999974 | 18553870667.35 |
| 27.166666666666405 | 18550678348.153 |
| 27.18333333333307 | 18547483710.74 |
| 27.199999999999736 | 18544286754.313 |
| 27.216666666666402 | 18541087478.072 |
| 27.233333333333068 | 18537885881.217 |
| 27.249999999999734 | 18534681962.948 |
| 27.2666666666664 | 18531475722.461 |
| 27.283333333333065 | 18528267158.954 |
| 27.29999999999973 | 18525056271.621 |
| 27.316666666666396 | 18521843059.659 |
| 27.333333333333062 | 18518627522.26 |
| 27.349999999999728 | 18515409658.618 |
| 27.366666666666394 | 18512189467.923 |
| 27.38333333333306 | 18508966949.367 |
| 27.399999999999725 | 18505742102.14 |
| 27.41666666666639 | 18502514925.43 |
| 27.433333333333056 | 18499285418.425 |
| 27.449999999999722 | 18496053580.311 |
| 27.466666666666388 | 18492819410.275 |
| 27.483333333333054 | 18489582907.5 |
| 27.49999999999972 | 18486344071.171 |
| 27.516666666666385 | 18483102900.469 |
| 27.53333333333305 | 18479859394.578 |
| 27.549999999999716 | 18476613552.676 |
| 27.566666666666382 | 18473365373.945 |
| 27.583333333333048 | 18470114857.562 |
| 27.599999999999714 | 18466862002.704 |
| 27.61666666666638 | 18463606808.549 |
| 27.633333333333045 | 18460349274.271 |
| 27.64999999999971 | 18457089399.046 |
| 27.666666666666377 | 18453827182.046 |
| 27.683333333333042 | 18450562622.444 |
| 27.699999999999708 | 18447295719.411 |
| 27.716666666666374 | 18444026472.117 |
| 27.73333333333304 | 18440754879.732 |
| 27.749999999999705 | 18437480941.424 |
| 27.76666666666637 | 18434204656.361 |
| 27.783333333333037 | 18430926023.707 |
| 27.799999999999702 | 18427645042.629 |
| 27.816666666666368 | 18424361712.29 |
| 27.833333333333034 | 18421076031.853 |
| 27.8499999999997 | 18417788000.481 |
| 27.866666666666365 | 18414497617.333 |
| 27.88333333333303 | 18411204881.571 |
| 27.899999999999697 | 18407909792.353 |
| 27.916666666666362 | 18404612348.836 |
| 27.933333333333028 | 18401312550.177 |
| 27.949999999999694 | 18398010395.533 |
| 27.96666666666636 | 18394705884.056 |
| 27.983333333333025 | 18391399014.902 |
| 27.99999999999969 | 18388089787.222 |
| 28.016666666666357 | 18384778200.169 |
| 28.033333333333022 | 18381464252.891 |
| 28.049999999999688 | 18378147944.538 |
| 28.066666666666354 | 18374829274.26 |
| 28.08333333333302 | 18371508241.202 |
| 28.099999999999685 | 18368184844.511 |
| 28.11666666666635 | 18364859083.331 |
| 28.133333333333017 | 18361530956.808 |
| 28.149999999999682 | 18358200464.083 |
| 28.166666666666348 | 18354867604.298 |
| 28.183333333333014 | 18351532376.594 |
| 28.19999999999968 | 18348194780.111 |
| 28.216666666666345 | 18344854813.987 |
| 28.23333333333301 | 18341512477.36 |
| 28.249999999999677 | 18338167769.366 |
| 28.266666666666342 | 18334820689.139 |
| 28.283333333333008 | 18331471235.816 |
| 28.299999999999674 | 18328119408.528 |
| 28.31666666666634 | 18324765206.407 |
| 28.333333333333005 | 18321408628.585 |
| 28.34999999999967 | 18318049674.191 |
| 28.366666666666337 | 18314688342.354 |
| 28.383333333333002 | 18311324632.202 |
| 28.399999999999668 | 18307958542.861 |
| 28.416666666666334 | 18304590073.457 |
| 28.433333333333 | 18301219223.114 |
| 28.449999999999665 | 18297845990.955 |
| 28.46666666666633 | 18294470376.102 |
| 28.483333333332997 | 18291092377.676 |
| 28.499999999999662 | 18287711994.798 |
| 28.516666666666328 | 18284329226.586 |
| 28.533333333332994 | 18280944072.158 |
| 28.54999999999966 | 18277556530.63 |
| 28.566666666666325 | 18274166601.117 |
| 28.58333333333299 | 18270774282.735 |
| 28.599999999999657 | 18267379574.597 |
| 28.616666666666323 | 18263982475.814 |
| 28.63333333333299 | 18260582985.497 |
| 28.649999999999654 | 18257181102.757 |
| 28.66666666666632 | 18253776826.702 |
| 28.683333333332985 | 18250370156.439 |
| 28.69999999999965 | 18246961091.076 |
| 28.716666666666317 | 18243549629.717 |
| 28.733333333332983 | 18240135771.468 |
| 28.74999999999965 | 18236719515.43 |
| 28.766666666666314 | 18233300860.706 |
| 28.78333333333298 | 18229879806.397 |
| 28.799999999999645 | 18226456351.602 |
| 28.81666666666631 | 18223030495.42 |
| 28.833333333332977 | 18219602236.949 |
| 28.849999999999643 | 18216171575.284 |
| 28.86666666666631 | 18212738509.522 |
| 28.883333333332974 | 18209303038.754 |
| 28.89999999999964 | 18205865162.076 |
| 28.916666666666305 | 18202424878.578 |
| 28.93333333333297 | 18198982187.351 |
| 28.949999999999637 | 18195537087.483 |
| 28.966666666666303 | 18192089578.065 |
| 28.98333333333297 | 18188639658.182 |
| 28.999999999999634 | 18185187326.92 |
| 29.0166666666663 | 18181732583.364 |
| 29.033333333332966 | 18178275426.598 |
| 29.04999999999963 | 18174815855.705 |
| 29.066666666666297 | 18171353869.765 |
| 29.083333333332963 | 18167889467.858 |
| 29.09999999999963 | 18164422649.064 |
| 29.116666666666294 | 18160953412.46 |
| 29.13333333333296 | 18157481757.123 |
| 29.149999999999626 | 18154007682.128 |
| 29.16666666666629 | 18150531186.55 |
| 29.183333333332957 | 18147052269.461 |
| 29.199999999999623 | 18143570929.934 |
| 29.21666666666629 | 18140087167.039 |
| 29.233333333332954 | 18136600979.845 |
| 29.24999999999962 | 18133112367.422 |
| 29.266666666666286 | 18129621328.835 |
| 29.28333333333295 | 18126127863.152 |
| 29.299999999999617 | 18122631969.436 |
| 29.316666666666283 | 18119133646.752 |
| 29.33333333333295 | 18115632894.162 |
| 29.349999999999614 | 18112129710.727 |
| 29.36666666666628 | 18108624095.507 |
| 29.383333333332946 | 18105116047.56 |
| 29.39999999999961 | 18101605565.945 |
| 29.416666666666277 | 18098092649.718 |
| 29.433333333332943 | 18094577297.934 |
| 29.44999999999961 | 18091059509.647 |
| 29.466666666666274 | 18087539283.909 |
| 29.48333333333294 | 18084016619.773 |
| 29.499999999999606 | 18080491516.289 |
| 29.51666666666627 | 18076963972.505 |
| 29.533333333332937 | 18073433987.47 |
| 29.549999999999603 | 18069901560.231 |
| 29.56666666666627 | 18066366689.832 |
| 29.583333333332934 | 18062829375.319 |
| 29.5999999999996 | 18059289615.734 |
| 29.616666666666266 | 18055747410.119 |
| 29.63333333333293 | 18052202757.515 |
| 29.649999999999597 | 18048655656.961 |
| 29.666666666666263 | 18045106107.495 |
| 29.68333333333293 | 18041554108.154 |
| 29.699999999999594 | 18037999657.974 |
| 29.71666666666626 | 18034442755.99 |
| 29.733333333332926 | 18030883401.234 |
| 29.74999999999959 | 18027321592.738 |
| 29.766666666666257 | 18023757329.533 |
| 29.783333333332923 | 18020190610.649 |
| 29.79999999999959 | 18016621435.113 |
| 29.816666666666254 | 18013049801.954 |
| 29.83333333333292 | 18009475710.196 |
| 29.849999999999586 | 18005899158.864 |
| 29.86666666666625 | 18002320146.982 |
| 29.883333333332917 | 17998738673.57 |
| 29.899999999999583 | 17995154737.651 |
| 29.91666666666625 | 17991568338.243 |
| 29.933333333332914 | 17987979474.365 |
| 29.94999999999958 | 17984388145.034 |
| 29.966666666666246 | 17980794349.264 |
| 29.98333333333291 | 17977198086.072 |
| 29.999999999999577 | 17973599354.469 |
| 30.016666666666243 | 17969998153.468 |
| 30.03333333333291 | 17966394482.079 |
| 30.049999999999574 | 17962788339.312 |
| 30.06666666666624 | 17959179724.174 |
| 30.083333333332906 | 17955568635.673 |
| 30.09999999999957 | 17951955072.814 |
| 30.116666666666237 | 17948339034.602 |
| 30.133333333332903 | 17944720520.038 |
| 30.14999999999957 | 17941099528.125 |
| 30.166666666666234 | 17937476057.863 |
| 30.1833333333329 | 17933850108.251 |
| 30.199999999999566 | 17930221678.287 |
| 30.21666666666623 | 17926590766.967 |
| 30.233333333332897 | 17922957373.287 |
| 30.249999999999563 | 17919321496.241 |
| 30.26666666666623 | 17915683134.82 |
| 30.283333333332894 | 17912042288.017 |
| 30.29999999999956 | 17908398954.821 |
| 30.316666666666226 | 17904753134.221 |
| 30.33333333333289 | 17901104825.205 |
| 30.349999999999557 | 17897454026.757 |
| 30.366666666666223 | 17893800737.864 |
| 30.38333333333289 | 17890144957.508 |
| 30.399999999999554 | 17886486684.672 |
| 30.41666666666622 | 17882825918.336 |
| 30.433333333332886 | 17879162657.481 |
| 30.44999999999955 | 17875496901.083 |
| 30.466666666666217 | 17871828648.12 |
| 30.483333333332883 | 17868157897.567 |
| 30.49999999999955 | 17864484648.399 |
| 30.516666666666215 | 17860808899.588 |
| 30.53333333333288 | 17857130650.106 |
| 30.549999999999546 | 17853449898.923 |
| 30.56666666666621 | 17849766645.008 |
| 30.583333333332877 | 17846080887.328 |
| 30.599999999999543 | 17842392624.85 |
| 30.61666666666621 | 17838701856.538 |
| 30.633333333332875 | 17835008581.355 |
| 30.64999999999954 | 17831312798.265 |
| 30.666666666666206 | 17827614506.226 |
| 30.68333333333287 | 17823913704.2 |
| 30.699999999999537 | 17820210391.144 |
| 30.716666666666203 | 17816504566.015 |
| 30.73333333333287 | 17812796227.767 |
| 30.749999999999535 | 17809085375.356 |
| 30.7666666666662 | 17805372007.733 |
| 30.783333333332866 | 17801656123.85 |
| 30.79999999999953 | 17797937722.657 |
| 30.816666666666197 | 17794216803.102 |
| 30.833333333332863 | 17790493364.132 |
| 30.84999999999953 | 17786767404.694 |
| 30.866666666666195 | 17783038923.731 |
| 30.88333333333286 | 17779307920.187 |
| 30.899999999999526 | 17775574393.003 |
| 30.916666666666192 | 17771838341.119 |
| 30.933333333332858 | 17768099763.474 |
| 30.949999999999523 | 17764358659.007 |
| 30.96666666666619 | 17760615026.652 |
| 30.983333333332855 | 17756868865.344 |
| 30.99999999999952 | 17753120174.018 |
| 31.016666666666186 | 17749368951.604 |
| 31.033333333332852 | 17745615197.033 |
| 31.049999999999518 | 17741858909.234 |
| 31.066666666666183 | 17738100087.136 |
| 31.08333333333285 | 17734338729.664 |
| 31.099999999999515 | 17730574835.743 |
| 31.11666666666618 | 17726808404.297 |
| 31.133333333332846 | 17723039434.247 |
| 31.149999999999512 | 17719267924.515 |
| 31.166666666666178 | 17715493874.019 |
| 31.183333333332843 | 17711717281.678 |
| 31.19999999999951 | 17707938146.407 |
| 31.216666666666175 | 17704156467.123 |
| 31.23333333333284 | 17700372242.737 |
| 31.249999999999506 | 17696585472.163 |
| 31.266666666666172 | 17692796154.311 |
| 31.283333333332838 | 17689004288.091 |
| 31.299999999999503 | 17685209872.409 |
| 31.31666666666617 | 17681412906.174 |
| 31.333333333332835 | 17677613388.288 |
| 31.3499999999995 | 17673811317.657 |
| 31.366666666666166 | 17670006693.182 |
| 31.383333333332832 | 17666199513.763 |
| 31.399999999999498 | 17662389778.3 |
| 31.416666666666163 | 17658577485.691 |
| 31.43333333333283 | 17654762634.831 |
| 31.449999999999495 | 17650945224.616 |
| 31.46666666666616 | 17647125253.939 |
| 31.483333333332826 | 17643302721.691 |
| 31.499999999999492 | 17639477626.764 |
| 31.516666666666158 | 17635649968.046 |
| 31.533333333332823 | 17631819744.424 |
| 31.54999999999949 | 17627986954.785 |
| 31.566666666666155 | 17624151598.013 |
| 31.58333333333282 | 17620313672.992 |
| 31.599999999999486 | 17616473178.602 |
| 31.616666666666152 | 17612630113.724 |
| 31.633333333332818 | 17608784477.236 |
| 31.649999999999483 | 17604936268.016 |
| 31.66666666666615 | 17601085484.939 |
| 31.683333333332815 | 17597232126.88 |
| 31.69999999999948 | 17593376192.711 |
| 31.716666666666146 | 17589517681.303 |
| 31.733333333332812 | 17585656591.526 |
| 31.749999999999478 | 17581792922.248 |
| 31.766666666666143 | 17577926672.336 |
| 31.78333333333281 | 17574057840.654 |
| 31.799999999999475 | 17570186426.068 |
| 31.81666666666614 | 17566312427.438 |
| 31.833333333332806 | 17562435843.625 |
| 31.849999999999472 | 17558556673.489 |
| 31.866666666666138 | 17554674915.887 |
| 31.883333333332804 | 17550790569.675 |
| 31.89999999999947 | 17546903633.707 |
| 31.916666666666135 | 17543014106.838 |
| 31.9333333333328 | 17539121987.917 |
| 31.949999999999466 | 17535227275.796 |
| 31.966666666666132 | 17531329969.323 |
| 31.983333333332798 | 17527430067.344 |
| 31.999999999999464 | 17523527568.705 |
| 32.01666666666613 | 17519622472.249 |
| 32.0333333333328 | 17515714776.82 |
| 32.049999999999464 | 17511804481.258 |
| 32.06666666666613 | 17507891584.402 |
| 32.083333333332796 | 17503976085.089 |
| 32.09999999999946 | 17500057982.156 |
| 32.11666666666613 | 17496137274.437 |
| 32.13333333333279 | 17492213960.765 |
| 32.14999999999946 | 17488288039.972 |
| 32.166666666666124 | 17484359510.888 |
| 32.18333333333279 | 17480428372.34 |
| 32.199999999999456 | 17476494623.156 |
| 32.21666666666612 | 17472558262.161 |
| 32.23333333333279 | 17468619288.177 |
| 32.24999999999945 | 17464677700.028 |
| 32.26666666666612 | 17460733496.533 |
| 32.283333333332784 | 17456786676.512 |
| 32.29999999999945 | 17452837238.782 |
| 32.316666666666116 | 17448885182.158 |
| 32.33333333333278 | 17444930505.454 |
| 32.34999999999945 | 17440973207.484 |
| 32.36666666666611 | 17437013287.057 |
| 32.38333333333278 | 17433050742.983 |
| 32.399999999999444 | 17429085574.069 |
| 32.41666666666611 | 17425117779.123 |
| 32.433333333332776 | 17421147356.948 |
| 32.44999999999944 | 17417174306.347 |
| 32.46666666666611 | 17413198626.122 |
| 32.48333333333277 | 17409220315.071 |
| 32.49999999999944 | 17405239371.994 |
| 32.516666666666104 | 17401255795.686 |
| 32.53333333333277 | 17397269584.942 |
| 32.549999999999436 | 17393280738.555 |
| 32.5666666666661 | 17389289255.318 |
| 32.58333333333277 | 17385295134.019 |
| 32.59999999999943 | 17381298373.448 |
| 32.6166666666661 | 17377298972.39 |
| 32.633333333332764 | 17373296929.63 |
| 32.64999999999943 | 17369292243.953 |
| 32.666666666666096 | 17365284914.139 |
| 32.68333333333276 | 17361274938.969 |
| 32.69999999999943 | 17357262317.221 |
| 32.71666666666609 | 17353247047.672 |
| 32.73333333333276 | 17349229129.097 |
| 32.749999999999424 | 17345208560.27 |
| 32.76666666666609 | 17341185339.961 |
| 32.783333333332756 | 17337159466.942 |
| 32.79999999999942 | 17333130939.98 |
| 32.81666666666609 | 17329099757.843 |
| 32.83333333333275 | 17325065919.295 |
| 32.84999999999942 | 17321029423.1 |
| 32.866666666666084 | 17316990268.02 |
| 32.88333333333275 | 17312948452.814 |
| 32.899999999999416 | 17308903976.242 |
| 32.91666666666608 | 17304856837.059 |
| 32.93333333333275 | 17300807034.021 |
| 32.94999999999941 | 17296754565.881 |
| 32.96666666666608 | 17292699431.391 |
| 32.983333333332745 | 17288641629.3 |
| 32.99999999999941 | 17284581158.357 |
| 33.016666666666076 | 17280518017.308 |
| 33.03333333333274 | 17276452204.898 |
| 33.04999999999941 | 17272383719.87 |
| 33.06666666666607 | 17268312560.965 |
| 33.08333333333274 | 17264238726.923 |
| 33.099999999999405 | 17260162216.482 |
| 33.11666666666607 | 17256083028.379 |
| 33.133333333332736 | 17252001161.347 |
| 33.1499999999994 | 17247916614.119 |
| 33.16666666666607 | 17243829385.426 |
| 33.18333333333273 | 17239739473.998 |
| 33.1999999999994 | 17235646878.562 |
| 33.216666666666065 | 17231551597.844 |
| 33.23333333333273 | 17227453630.568 |
| 33.249999999999396 | 17223352975.456 |
| 33.26666666666606 | 17219249631.229 |
| 33.28333333333273 | 17215143596.605 |
| 33.29999999999939 | 17211034870.302 |
| 33.31666666666606 | 17206923451.035 |
| 33.333333333332725 | 17202809337.517 |
| 33.34999999999939 | 17198692528.46 |
| 33.366666666666056 | 17194573022.575 |
| 33.38333333333272 | 17190450818.568 |
| 33.39999999999939 | 17186325915.147 |
| 33.41666666666605 | 17182198311.017 |
| 33.43333333333272 | 17178068004.88 |
| 33.449999999999385 | 17173934995.437 |
| 33.46666666666605 | 17169799281.387 |
| 33.483333333332716 | 17165660861.429 |
| 33.49999999999938 | 17161519734.257 |
| 33.51666666666605 | 17157375898.567 |
| 33.53333333333271 | 17153229353.049 |
| 33.54999999999938 | 17149080096.394 |
| 33.566666666666045 | 17144928127.29 |
| 33.58333333333271 | 17140773444.425 |
| 33.599999999999376 | 17136616046.484 |
| 33.61666666666604 | 17132455932.148 |
| 33.63333333333271 | 17128293100.1 |
| 33.64999999999937 | 17124127549.018 |
| 33.66666666666604 | 17119959277.582 |
| 33.683333333332705 | 17115788284.465 |
| 33.69999999999937 | 17111614568.342 |
| 33.716666666666036 | 17107438127.886 |
| 33.7333333333327 | 17103258961.766 |
| 33.74999999999937 | 17099077068.652 |
| 33.76666666666603 | 17094892447.208 |
| 33.7833333333327 | 17090705096.101 |
| 33.799999999999365 | 17086515013.993 |
| 33.81666666666603 | 17082322199.544 |
| 33.833333333332696 | 17078126651.415 |
| 33.84999999999936 | 17073928368.263 |
| 33.86666666666603 | 17069727348.742 |
| 33.88333333333269 | 17065523591.507 |
| 33.89999999999936 | 17061317095.209 |
| 33.916666666666025 | 17057107858.497 |
| 33.93333333333269 | 17052895880.021 |
| 33.949999999999356 | 17048681158.425 |
| 33.96666666666602 | 17044463692.355 |
| 33.98333333333269 | 17040243480.451 |
| 33.99999999999935 | 17036020521.355 |
| 34.01666666666602 | 17031794813.706 |
| 34.033333333332685 | 17027566356.139 |
| 34.04999999999935 | 17023335147.289 |
| 34.066666666666016 | 17019101185.79 |
| 34.08333333333268 | 17014864470.271 |
| 34.09999999999935 | 17010624999.362 |
| 34.11666666666601 | 17006382771.691 |
| 34.13333333333268 | 17002137785.881 |
| 34.149999999999345 | 16997890040.556 |
| 34.16666666666601 | 16993639534.338 |
| 34.183333333332676 | 16989386265.846 |
| 34.19999999999934 | 16985130233.697 |
| 34.21666666666601 | 16980871436.506 |
| 34.23333333333267 | 16976609872.888 |
| 34.24999999999934 | 16972345541.453 |
| 34.266666666666005 | 16968078440.811 |
| 34.28333333333267 | 16963808569.571 |
| 34.299999999999336 | 16959535926.337 |
| 34.316666666666 | 16955260509.714 |
| 34.33333333333267 | 16950982318.302 |
| 34.34999999999933 | 16946701350.703 |
| 34.366666666666 | 16942417605.514 |
| 34.383333333332665 | 16938131081.33 |
| 34.39999999999933 | 16933841776.746 |
| 34.416666666665996 | 16929549690.353 |
| 34.43333333333266 | 16925254820.742 |
| 34.44999999999933 | 16920957166.501 |
| 34.46666666666599 | 16916656726.214 |
| 34.48333333333266 | 16912353498.468 |
| 34.499999999999325 | 16908047481.842 |
| 34.51666666666599 | 16903738674.918 |
| 34.533333333332656 | 16899427076.273 |
| 34.54999999999932 | 16895112684.483 |
| 34.56666666666599 | 16890795498.122 |
| 34.583333333332654 | 16886475515.762 |
| 34.59999999999932 | 16882152735.973 |
| 34.616666666665985 | 16877827157.323 |
| 34.63333333333265 | 16873498778.377 |
| 34.64999999999932 | 16869167597.7 |
| 34.66666666666598 | 16864833613.853 |
| 34.68333333333265 | 16860496825.395 |
| 34.699999999999314 | 16856157230.886 |
| 34.71666666666598 | 16851814828.879 |
| 34.733333333332645 | 16847469617.93 |
| 34.74999999999931 | 16843121596.588 |
| 34.76666666666598 | 16838770763.405 |
| 34.78333333333264 | 16834417116.927 |
| 34.79999999999931 | 16830060655.699 |
| 34.816666666665974 | 16825701378.265 |
| 34.83333333333264 | 16821339283.166 |
| 34.849999999999305 | 16816974368.941 |
| 34.86666666666597 | 16812606634.128 |
| 34.88333333333264 | 16808236077.261 |
| 34.8999999999993 | 16803862696.872 |
| 34.91666666666597 | 16799486491.494 |
| 34.933333333332634 | 16795107459.654 |
| 34.9499999999993 | 16790725599.879 |
| 34.966666666665965 | 16786340910.693 |
| 34.98333333333263 | 16781953390.619 |
| 34.9999999999993 | 16777563038.178 |
| 35.01666666666596 | 16773169851.887 |
| 35.03333333333263 | 16768773830.262 |
| 35.049999999999294 | 16764374971.817 |
| 35.06666666666596 | 16759973275.064 |
| 35.083333333332625 | 16755568738.512 |
| 35.09999999999929 | 16751161360.67 |
| 35.11666666666596 | 16746751140.042 |
| 35.13333333333262 | 16742338075.131 |
| 35.14999999999929 | 16737922164.439 |
| 35.166666666665954 | 16733503406.465 |
| 35.18333333333262 | 16729081799.705 |
| 35.199999999999285 | 16724657342.653 |
| 35.21666666666595 | 16720230033.803 |
| 35.23333333333262 | 16715799871.644 |
| 35.24999999999928 | 16711366854.665 |
| 35.26666666666595 | 16706930981.352 |
| 35.283333333332614 | 16702492250.187 |
| 35.29999999999928 | 16698050659.653 |
| 35.316666666665945 | 16693606208.229 |
| 35.33333333333261 | 16689158894.393 |
| 35.34999999999928 | 16684708716.618 |
| 35.36666666666594 | 16680255673.378 |
| 35.38333333333261 | 16675799763.144 |
| 35.399999999999274 | 16671340984.383 |
| 35.41666666666594 | 16666879335.562 |
| 35.433333333332605 | 16662414815.145 |
| 35.44999999999927 | 16657947421.594 |
| 35.46666666666594 | 16653477153.367 |
| 35.4833333333326 | 16649004008.922 |
| 35.49999999999927 | 16644527986.714 |
| 35.516666666665934 | 16640049085.195 |
| 35.5333333333326 | 16635567302.817 |
| 35.549999999999265 | 16631082638.028 |
| 35.56666666666593 | 16626595089.272 |
| 35.5833333333326 | 16622104654.995 |
| 35.59999999999926 | 16617611333.638 |
| 35.61666666666593 | 16613115123.639 |
| 35.633333333332594 | 16608616023.436 |
| 35.64999999999926 | 16604114031.463 |
| 35.666666666665925 | 16599609146.153 |
| 35.68333333333259 | 16595101365.936 |
| 35.69999999999926 | 16590590689.24 |
| 35.71666666666592 | 16586077114.49 |
| 35.73333333333259 | 16581560640.109 |
| 35.749999999999254 | 16577041264.518 |
| 35.76666666666592 | 16572518986.136 |
| 35.783333333332585 | 16567993803.38 |
| 35.79999999999925 | 16563465714.662 |
| 35.81666666666592 | 16558934718.395 |
| 35.83333333333258 | 16554400812.989 |
| 35.84999999999925 | 16549863996.849 |
| 35.866666666665914 | 16545324268.381 |
| 35.88333333333258 | 16540781625.988 |
| 35.899999999999245 | 16536236068.068 |
| 35.91666666666591 | 16531687593.02 |
| 35.93333333333258 | 16527136199.24 |
| 35.94999999999924 | 16522581885.119 |
| 35.96666666666591 | 16518024649.049 |
| 35.983333333332574 | 16513464489.418 |
| 35.99999999999924 | 16508901404.611 |
| 36.016666666665905 | 16504335393.013 |
| 36.03333333333257 | 16499766453.004 |
| 36.04999999999924 | 16495194582.962 |
| 36.0666666666659 | 16490619781.265 |
| 36.08333333333257 | 16486042046.286 |
| 36.099999999999234 | 16481461376.397 |
| 36.1166666666659 | 16476877769.967 |
| 36.133333333332565 | 16472291225.362 |
| 36.14999999999923 | 16467701740.947 |
| 36.1666666666659 | 16463109315.084 |
| 36.18333333333256 | 16458513946.132 |
| 36.19999999999923 | 16453915632.448 |
| 36.216666666665894 | 16449314372.388 |
| 36.23333333333256 | 16444710164.302 |
| 36.249999999999226 | 16440103006.542 |
| 36.26666666666589 | 16435492897.453 |
| 36.28333333333256 | 16430879835.382 |
| 36.29999999999922 | 16426263818.669 |
| 36.31666666666589 | 16421644845.657 |
| 36.333333333332554 | 16417022914.681 |
| 36.34999999999922 | 16412398024.077 |
| 36.366666666665886 | 16407770172.177 |
| 36.38333333333255 | 16403139357.312 |
| 36.39999999999922 | 16398505577.808 |
| 36.41666666666588 | 16393868831.992 |
| 36.43333333333255 | 16389229118.185 |
| 36.449999999999214 | 16384586434.709 |
| 36.46666666666588 | 16379940779.879 |
| 36.483333333332546 | 16375292152.012 |
| 36.49999999999921 | 16370640549.42 |
| 36.51666666666588 | 16365985970.412 |
| 36.53333333333254 | 16361328413.298 |
| 36.54999999999921 | 16356667876.381 |
| 36.566666666665874 | 16352004357.964 |
| 36.58333333333254 | 16347337856.346 |
| 36.599999999999206 | 16342668369.826 |
| 36.61666666666587 | 16337995896.699 |
| 36.63333333333254 | 16333320435.255 |
| 36.6499999999992 | 16328641983.786 |
| 36.66666666666587 | 16323960540.578 |
| 36.683333333332534 | 16319276103.916 |
| 36.6999999999992 | 16314588672.081 |
| 36.716666666665866 | 16309898243.354 |
| 36.73333333333253 | 16305204816.011 |
| 36.7499999999992 | 16300508388.327 |
| 36.76666666666586 | 16295808958.572 |
| 36.78333333333253 | 16291106525.017 |
| 36.799999999999194 | 16286401085.927 |
| 36.81666666666586 | 16281692639.567 |
| 36.833333333332526 | 16276981184.198 |
| 36.84999999999919 | 16272266718.077 |
| 36.86666666666586 | 16267549239.462 |
| 36.88333333333252 | 16262828746.606 |
| 36.89999999999919 | 16258105237.759 |
| 36.916666666665854 | 16253378711.169 |
| 36.93333333333252 | 16248649165.082 |
| 36.949999999999186 | 16243916597.741 |
| 36.96666666666585 | 16239181007.385 |
| 36.98333333333252 | 16234442392.252 |
| 36.99999999999918 | 16229700750.578 |
| 37.01666666666585 | 16224956080.593 |
| 37.033333333332514 | 16220208380.528 |
| 37.04999999999918 | 16215457648.609 |
| 37.066666666665846 | 16210703883.061 |
| 37.08333333333251 | 16205947082.104 |
| 37.09999999999918 | 16201187243.957 |
| 37.11666666666584 | 16196424366.836 |
| 37.13333333333251 | 16191658448.955 |
| 37.149999999999174 | 16186889488.524 |
| 37.16666666666584 | 16182117483.751 |
| 37.183333333332506 | 16177342432.84 |
| 37.19999999999917 | 16172564333.994 |
| 37.21666666666584 | 16167783185.414 |
| 37.2333333333325 | 16162998985.294 |
| 37.24999999999917 | 16158211731.831 |
| 37.266666666665834 | 16153421423.214 |
| 37.2833333333325 | 16148628057.632 |
| 37.299999999999166 | 16143831633.272 |
| 37.31666666666583 | 16139032148.317 |
| 37.3333333333325 | 16134229600.945 |
| 37.34999999999916 | 16129423989.336 |
| 37.36666666666583 | 16124615311.664 |
| 37.383333333332494 | 16119803566.1 |
| 37.39999999999916 | 16114988750.813 |
| 37.416666666665826 | 16110170863.971 |
| 37.43333333333249 | 16105349903.735 |
| 37.44999999999916 | 16100525868.268 |
| 37.46666666666582 | 16095698755.726 |
| 37.48333333333249 | 16090868564.265 |
| 37.499999999999154 | 16086035292.036 |
| 37.51666666666582 | 16081198937.19 |
| 37.533333333332486 | 16076359497.872 |
| 37.54999999999915 | 16071516972.225 |
| 37.56666666666582 | 16066671358.392 |
| 37.58333333333248 | 16061822654.509 |
| 37.59999999999915 | 16056970858.712 |
| 37.616666666665814 | 16052115969.132 |
| 37.63333333333248 | 16047257983.899 |
| 37.649999999999146 | 16042396901.139 |
| 37.66666666666581 | 16037532718.975 |
| 37.68333333333248 | 16032665435.529 |
| 37.69999999999914 | 16027795048.917 |
| 37.71666666666581 | 16022921557.254 |
| 37.733333333332475 | 16018044958.652 |
| 37.74999999999914 | 16013165251.22 |
| 37.766666666665806 | 16008282433.064 |
| 37.78333333333247 | 16003396502.286 |
| 37.79999999999914 | 15998507456.987 |
| 37.8166666666658 | 15993615295.264 |
| 37.83333333333247 | 15988720015.21 |
| 37.849999999999135 | 15983821614.918 |
| 37.8666666666658 | 15978920092.474 |
| 37.883333333332466 | 15974015445.965 |
| 37.89999999999913 | 15969107673.472 |
| 37.9166666666658 | 15964196773.075 |
| 37.93333333333246 | 15959282742.849 |
| 37.94999999999913 | 15954365580.869 |
| 37.966666666665795 | 15949445285.204 |
| 37.98333333333246 | 15944521853.921 |
| 37.999999999999126 | 15939595285.085 |
| 38.01666666666579 | 15934665576.756 |
| 38.03333333333246 | 15929732726.994 |
| 38.04999999999912 | 15924796733.852 |
| 38.06666666666579 | 15919857595.383 |
| 38.083333333332455 | 15914915309.635 |
| 38.09999999999912 | 15909969874.655 |
| 38.116666666665786 | 15905021288.486 |
| 38.13333333333245 | 15900069549.167 |
| 38.14999999999912 | 15895114654.735 |
| 38.16666666666578 | 15890156603.223 |
| 38.18333333333245 | 15885195392.662 |
| 38.199999999999115 | 15880231021.08 |
| 38.21666666666578 | 15875263486.5 |
| 38.233333333332446 | 15870292786.943 |
| 38.24999999999911 | 15865318920.429 |
| 38.26666666666578 | 15860341884.971 |
| 38.28333333333244 | 15855361678.582 |
| 38.29999999999911 | 15850378299.269 |
| 38.316666666665775 | 15845391745.04 |
| 38.33333333333244 | 15840402013.895 |
| 38.349999999999106 | 15835409103.834 |
| 38.36666666666577 | 15830413012.854 |
| 38.38333333333244 | 15825413738.946 |
| 38.3999999999991 | 15820411280.101 |
| 38.41666666666577 | 15815405634.305 |
| 38.433333333332435 | 15810396799.542 |
| 38.4499999999991 | 15805384773.791 |
| 38.466666666665766 | 15800369555.029 |
| 38.48333333333243 | 15795351141.23 |
| 38.4999999999991 | 15790329530.365 |
| 38.51666666666576 | 15785304720.4 |
| 38.53333333333243 | 15780276709.3 |
| 38.549999999999095 | 15775245495.025 |
| 38.56666666666576 | 15770211075.532 |
| 38.583333333332426 | 15765173448.777 |
| 38.59999999999909 | 15760132612.709 |
| 38.61666666666576 | 15755088565.277 |
| 38.63333333333242 | 15750041304.425 |
| 38.64999999999909 | 15744990828.094 |
| 38.666666666665755 | 15739937134.222 |
| 38.68333333333242 | 15734880220.743 |
| 38.699999999999086 | 15729820085.589 |
| 38.71666666666575 | 15724756726.687 |
| 38.73333333333242 | 15719690141.962 |
| 38.74999999999908 | 15714620329.336 |
| 38.76666666666575 | 15709547286.725 |
| 38.783333333332415 | 15704471012.046 |
| 38.79999999999908 | 15699391503.209 |
| 38.816666666665746 | 15694308758.121 |
| 38.83333333333241 | 15689222774.688 |
| 38.84999999999908 | 15684133550.81 |
| 38.86666666666574 | 15679041084.385 |
| 38.88333333333241 | 15673945373.308 |
| 38.899999999999075 | 15668846415.469 |
| 38.91666666666574 | 15663744208.756 |
| 38.933333333332406 | 15658638751.054 |
| 38.94999999999907 | 15653530040.242 |
| 38.96666666666574 | 15648418074.199 |
| 38.9833333333324 | 15643302850.797 |
| 38.99999999999907 | 15638184367.908 |
| 39.016666666665735 | 15633062623.399 |
| 39.0333333333324 | 15627937615.132 |
| 39.049999999999066 | 15622809340.968 |
| 39.06666666666573 | 15617677798.764 |
| 39.0833333333324 | 15612542986.373 |
| 39.09999999999906 | 15607404901.644 |
| 39.11666666666573 | 15602263542.424 |
| 39.133333333332395 | 15597118906.554 |
| 39.14999999999906 | 15591970991.875 |
| 39.166666666665726 | 15586819796.221 |
| 39.18333333333239 | 15581665317.426 |
| 39.19999999999906 | 15576507553.317 |
| 39.21666666666572 | 15571346501.719 |
| 39.23333333333239 | 15566182160.454 |
| 39.249999999999055 | 15561014527.339 |
| 39.26666666666572 | 15555843600.19 |
| 39.283333333332386 | 15550669376.817 |
| 39.29999999999905 | 15545491855.026 |
| 39.31666666666572 | 15540311032.622 |
| 39.333333333332384 | 15535126907.405 |
| 39.34999999999905 | 15529939477.171 |
| 39.366666666665715 | 15524748739.712 |
| 39.38333333333238 | 15519554692.818 |
| 39.39999999999905 | 15514357334.274 |
| 39.41666666666571 | 15509156661.863 |
| 39.43333333333238 | 15503952673.362 |
| 39.449999999999044 | 15498745366.547 |
| 39.46666666666571 | 15493534739.187 |
| 39.483333333332375 | 15488320789.05 |
| 39.49999999999904 | 15483103513.9 |
| 39.51666666666571 | 15477882911.497 |
| 39.53333333333237 | 15472658979.597 |
| 39.54999999999904 | 15467431715.952 |
| 39.566666666665704 | 15462201118.311 |
| 39.58333333333237 | 15456967184.42 |
| 39.599999999999035 | 15451729912.019 |
| 39.6166666666657 | 15446489298.846 |
| 39.63333333333237 | 15441245342.635 |
| 39.64999999999903 | 15435998041.116 |
| 39.6666666666657 | 15430747392.015 |
| 39.683333333332364 | 15425493393.055 |
| 39.69999999999903 | 15420236041.955 |
| 39.716666666665695 | 15414975336.429 |
| 39.73333333333236 | 15409711274.189 |
| 39.74999999999903 | 15404443852.942 |
| 39.76666666666569 | 15399173070.393 |
| 39.78333333333236 | 15393898924.239 |
| 39.799999999999024 | 15388621412.178 |
| 39.81666666666569 | 15383340531.902 |
| 39.833333333332355 | 15378056281.098 |
| 39.84999999999902 | 15372768657.451 |
| 39.86666666666569 | 15367477658.642 |
| 39.88333333333235 | 15362183282.346 |
| 39.89999999999902 | 15356885526.238 |
| 39.916666666665684 | 15351584387.986 |
| 39.93333333333235 | 15346279865.254 |
| 39.949999999999015 | 15340971955.703 |
| 39.96666666666568 | 15335660656.992 |
| 39.98333333333235 | 15330345966.772 |
| 39.99999999999901 | 15325027882.694 |
| 40.01666666666568 | 15319706402.402 |
| 40.033333333332344 | 15314381523.537 |
| 40.04999999999901 | 15309053243.738 |
| 40.066666666665675 | 15303721560.638 |
| 40.08333333333234 | 15298386471.865 |
| 40.09999999999901 | 15293047975.046 |
| 40.11666666666567 | 15287706067.801 |
| 40.13333333333234 | 15282360747.748 |
| 40.149999999999004 | 15277012012.501 |
| 40.16666666666567 | 15271659859.668 |
| 40.183333333332335 | 15266304286.856 |
| 40.199999999999 | 15260945291.665 |
| 40.21666666666567 | 15255582871.692 |
| 40.23333333333233 | 15250217024.531 |
| 40.249999999999 | 15244847747.771 |
| 40.266666666665664 | 15239475038.996 |
| 40.28333333333233 | 15234098895.787 |
| 40.299999999998995 | 15228719315.722 |
| 40.31666666666566 | 15223336296.372 |
| 40.33333333333233 | 15217949835.307 |
| 40.34999999999899 | 15212559930.09 |
| 40.36666666666566 | 15207166578.282 |
| 40.383333333332324 | 15201769777.439 |
| 40.39999999999899 | 15196369525.113 |
| 40.416666666665655 | 15190965818.851 |
| 40.43333333333232 | 15185558656.197 |
| 40.44999999999899 | 15180148034.691 |
| 40.46666666666565 | 15174733951.867 |
| 40.48333333333232 | 15169316405.256 |
| 40.499999999998984 | 15163895392.385 |
| 40.51666666666565 | 15158470910.777 |
| 40.533333333332315 | 15153042957.95 |
| 40.54999999999898 | 15147611531.417 |
| 40.56666666666565 | 15142176628.689 |
| 40.58333333333231 | 15136738247.271 |
| 40.59999999999898 | 15131296384.663 |
| 40.616666666665644 | 15125851038.363 |
| 40.63333333333231 | 15120402205.864 |
| 40.649999999998975 | 15114949884.653 |
| 40.66666666666564 | 15109494072.214 |
| 40.68333333333231 | 15104034766.027 |
| 40.69999999999897 | 15098571963.567 |
| 40.71666666666564 | 15093105662.305 |
| 40.733333333332304 | 15087635859.708 |
| 40.74999999999897 | 15082162553.237 |
| 40.766666666665635 | 15076685740.35 |
| 40.7833333333323 | 15071205418.501 |
| 40.79999999999897 | 15065721585.138 |
| 40.81666666666563 | 15060234237.706 |
| 40.8333333333323 | 15054743373.645 |
| 40.849999999998964 | 15049248990.391 |
| 40.86666666666563 | 15043751085.374 |
| 40.883333333332295 | 15038249656.022 |
| 40.89999999999896 | 15032744699.756 |
| 40.91666666666563 | 15027236213.995 |
| 40.93333333333229 | 15021724196.151 |
| 40.94999999999896 | 15016208643.634 |
| 40.966666666665624 | 15010689553.847 |
| 40.98333333333229 | 15005166924.19 |
| 40.999999999998956 | 14999640752.059 |
| 41.01666666666562 | 14994111034.843 |
| 41.03333333333229 | 14988577769.93 |
| 41.04999999999895 | 14983040954.7 |
| 41.06666666666562 | 14977500586.53 |
| 41.083333333332284 | 14971956662.793 |
| 41.09999999999895 | 14966409180.857 |
| 41.116666666665616 | 14960858138.083 |
| 41.13333333333228 | 14955303531.832 |
| 41.14999999999895 | 14949745359.456 |
| 41.16666666666561 | 14944183618.305 |
| 41.18333333333228 | 14938618305.723 |
| 41.199999999998944 | 14933049419.05 |
| 41.21666666666561 | 14927476955.621 |
| 41.233333333332276 | 14921900912.767 |
| 41.24999999999894 | 14916321287.813 |
| 41.26666666666561 | 14910738078.081 |
| 41.28333333333227 | 14905151280.886 |
| 41.29999999999894 | 14899560893.54 |
| 41.316666666665604 | 14893966913.351 |
| 41.33333333333227 | 14888369337.619 |
| 41.349999999998936 | 14882768163.642 |
| 41.3666666666656 | 14877163388.713 |
| 41.38333333333227 | 14871555010.12 |
| 41.39999999999893 | 14865943025.144 |
| 41.4166666666656 | 14860327431.065 |
| 41.433333333332264 | 14854708225.155 |
| 41.44999999999893 | 14849085404.683 |
| 41.466666666665596 | 14843458966.911 |
| 41.48333333333226 | 14837828909.1 |
| 41.49999999999893 | 14832195228.501 |
| 41.51666666666559 | 14826557922.366 |
| 41.53333333333226 | 14820916987.936 |
| 41.549999999998924 | 14815272422.451 |
| 41.56666666666559 | 14809624223.145 |
| 41.583333333332256 | 14803972387.248 |
| 41.59999999999892 | 14798316911.983 |
| 41.61666666666559 | 14792657794.57 |
| 41.63333333333225 | 14786995032.223 |
| 41.64999999999892 | 14781328622.15 |
| 41.666666666665584 | 14775658561.557 |
| 41.68333333333225 | 14769984847.642 |
| 41.699999999998916 | 14764307477.6 |
| 41.71666666666558 | 14758626448.619 |
| 41.73333333333225 | 14752941757.884 |
| 41.74999999999891 | 14747253402.573 |
| 41.76666666666558 | 14741561379.861 |
| 41.783333333332244 | 14735865686.917 |
| 41.79999999999891 | 14730166320.903 |
| 41.816666666665576 | 14724463278.979 |
| 41.83333333333224 | 14718756558.298 |
| 41.84999999999891 | 14713046156.008 |
| 41.86666666666557 | 14707332069.253 |
| 41.88333333333224 | 14701614295.169 |
| 41.899999999998904 | 14695892830.891 |
| 41.91666666666557 | 14690167673.546 |
| 41.933333333332236 | 14684438820.255 |
| 41.9499999999989 | 14678706268.137 |
| 41.96666666666557 | 14672970014.303 |
| 41.98333333333223 | 14667230055.859 |
| 41.9999999999989 | 14661486389.908 |
| 42.016666666665564 | 14655739013.544 |
| 42.03333333333223 | 14649987923.86 |
| 42.049999999998896 | 14644233117.939 |
| 42.06666666666556 | 14638474592.864 |
| 42.08333333333223 | 14632712345.708 |
| 42.09999999999889 | 14626946373.54 |
| 42.11666666666556 | 14621176673.426 |
| 42.133333333332224 | 14615403242.424 |
| 42.14999999999889 | 14609626077.586 |
| 42.166666666665556 | 14603845175.962 |
| 42.18333333333222 | 14598060534.594 |
| 42.19999999999889 | 14592272150.518 |
| 42.21666666666555 | 14586480020.767 |
| 42.23333333333222 | 14580684142.367 |
| 42.249999999998884 | 14574884512.338 |
| 42.26666666666555 | 14569081127.696 |
| 42.283333333332216 | 14563273985.45 |
| 42.29999999999888 | 14557463082.606 |
| 42.31666666666555 | 14551648416.161 |
| 42.33333333333221 | 14545829983.108 |
| 42.34999999999888 | 14540007780.436 |
| 42.366666666665544 | 14534181805.127 |
| 42.38333333333221 | 14528352054.156 |
| 42.399999999998876 | 14522518524.495 |
| 42.41666666666554 | 14516681213.109 |
| 42.43333333333221 | 14510840116.958 |
| 42.44999999999887 | 14504995232.996 |
| 42.46666666666554 | 14499146558.17 |
| 42.483333333332205 | 14493294089.425 |
| 42.49999999999887 | 14487437823.696 |
| 42.516666666665536 | 14481577757.915 |
| 42.5333333333322 | 14475713889.008 |
| 42.54999999999887 | 14469846213.894 |
| 42.56666666666553 | 14463974729.487 |
| 42.5833333333322 | 14458099432.697 |
| 42.599999999998865 | 14452220320.424 |
| 42.61666666666553 | 14446337389.567 |
| 42.633333333332196 | 14440450637.016 |
| 42.64999999999886 | 14434560059.656 |
| 42.66666666666553 | 14428665654.366 |
| 42.68333333333219 | 14422767418.021 |
| 42.69999999999886 | 14416865347.487 |
| 42.716666666665525 | 14410959439.626 |
| 42.73333333333219 | 14405049691.294 |
| 42.749999999998856 | 14399136099.341 |
| 42.76666666666552 | 14393218660.61 |
| 42.78333333333219 | 14387297371.941 |
| 42.79999999999885 | 14381372230.164 |
| 42.81666666666552 | 14375443232.106 |
| 42.833333333332185 | 14369510374.587 |
| 42.84999999999885 | 14363573654.422 |
| 42.866666666665516 | 14357633068.417 |
| 42.88333333333218 | 14351688613.375 |
| 42.89999999999885 | 14345740286.092 |
| 42.91666666666551 | 14339788083.358 |
| 42.93333333333218 | 14333832001.957 |
| 42.949999999998845 | 14327872038.666 |
| 42.96666666666551 | 14321908190.257 |
| 42.983333333332176 | 14315940453.496 |
| 42.99999999999884 | 14309968825.14 |
| 43.01666666666551 | 14303993301.945 |
| 43.03333333333217 | 14298013880.656 |
| 43.04999999999884 | 14292030558.014 |
| 43.066666666665505 | 14286043330.754 |
| 43.08333333333217 | 14280052195.604 |
| 43.099999999998836 | 14274057149.286 |
| 43.1166666666655 | 14268058188.515 |
| 43.13333333333217 | 14262055310.002 |
| 43.14999999999883 | 14256048510.449 |
| 43.1666666666655 | 14250037786.553 |
| 43.183333333332165 | 14244023135.004 |
| 43.19999999999883 | 14238004552.487 |
| 43.216666666665496 | 14231982035.68 |
| 43.23333333333216 | 14225955581.253 |
| 43.24999999999883 | 14219925185.872 |
| 43.26666666666549 | 14213890846.195 |
| 43.28333333333216 | 14207852558.875 |
| 43.299999999998825 | 14201810320.556 |
| 43.31666666666549 | 14195764127.879 |
| 43.333333333332156 | 14189713977.475 |
| 43.34999999999882 | 14183659865.971 |
| 43.36666666666549 | 14177601789.987 |
| 43.38333333333215 | 14171539746.135 |
| 43.39999999999882 | 14165473731.022 |
| 43.416666666665485 | 14159403741.248 |
| 43.43333333333215 | 14153329773.407 |
| 43.449999999998816 | 14147251824.085 |
| 43.46666666666548 | 14141169889.862 |
| 43.48333333333215 | 14135083967.311 |
| 43.49999999999881 | 14128994052.999 |
| 43.51666666666548 | 14122900143.487 |
| 43.533333333332145 | 14116802235.328 |
| 43.54999999999881 | 14110700325.067 |
| 43.566666666665476 | 14104594409.246 |
| 43.58333333333214 | 14098484484.397 |
| 43.59999999999881 | 14092370547.047 |
| 43.61666666666547 | 14086252593.715 |
| 43.63333333333214 | 14080130620.913 |
| 43.649999999998805 | 14074004625.148 |
| 43.66666666666547 | 14067874602.919 |
| 43.683333333332136 | 14061740550.717 |
| 43.6999999999988 | 14055602465.029 |
| 43.71666666666547 | 14049460342.331 |
| 43.73333333333213 | 14043314179.096 |
| 43.7499999999988 | 14037163971.789 |
| 43.766666666665465 | 14031009716.865 |
| 43.78333333333213 | 14024851410.777 |
| 43.799999999998796 | 14018689049.967 |
| 43.81666666666546 | 14012522630.872 |
| 43.83333333333213 | 14006352149.921 |
| 43.84999999999879 | 14000177603.536 |
| 43.86666666666546 | 13993998988.133 |
| 43.883333333332125 | 13987816300.12 |
| 43.89999999999879 | 13981629535.897 |
| 43.916666666665456 | 13975438691.859 |
| 43.93333333333212 | 13969243764.392 |
| 43.94999999999879 | 13963044749.876 |
| 43.96666666666545 | 13956841644.682 |
| 43.98333333333212 | 13950634445.176 |
| 43.999999999998785 | 13944423147.716 |
| 44.01666666666545 | 13938207748.651 |
| 44.033333333332116 | 13931988244.326 |
| 44.04999999999878 | 13925764631.076 |
| 44.06666666666545 | 13919536905.23 |
| 44.083333333332114 | 13913305063.108 |
| 44.09999999999878 | 13907069101.025 |
| 44.116666666665445 | 13900829015.287 |
| 44.13333333333211 | 13894584802.193 |
| 44.149999999998776 | 13888336458.035 |
| 44.16666666666544 | 13882083979.096 |
| 44.18333333333211 | 13875827361.654 |
| 44.199999999998774 | 13869566601.977 |
| 44.21666666666544 | 13863301696.327 |
| 44.233333333332105 | 13857032640.959 |
| 44.24999999999877 | 13850759432.118 |
| 44.26666666666544 | 13844482066.043 |
| 44.2833333333321 | 13838200538.967 |
| 44.29999999999877 | 13831914847.112 |
| 44.316666666665434 | 13825624986.694 |
| 44.3333333333321 | 13819330953.923 |
| 44.349999999998765 | 13813032744.998 |
| 44.36666666666543 | 13806730356.112 |
| 44.3833333333321 | 13800423783.451 |
| 44.39999999999876 | 13794113023.192 |
| 44.41666666666543 | 13787798071.505 |
| 44.433333333332094 | 13781478924.552 |
| 44.44999999999876 | 13775155578.486 |
| 44.466666666665425 | 13768828029.453 |
| 44.48333333333209 | 13762496273.593 |
| 44.49999999999876 | 13756160307.035 |
| 44.51666666666542 | 13749820125.902 |
| 44.53333333333209 | 13743475726.309 |
| 44.549999999998754 | 13737127104.361 |
| 44.56666666666542 | 13730774256.158 |
| 44.583333333332085 | 13724417177.791 |
| 44.59999999999875 | 13718055865.34 |
| 44.61666666666542 | 13711690314.882 |
| 44.63333333333208 | 13705320522.482 |
| 44.64999999999875 | 13698946484.199 |
| 44.666666666665414 | 13692568196.083 |
| 44.68333333333208 | 13686185654.176 |
| 44.699999999998745 | 13679798854.511 |
| 44.71666666666541 | 13673407793.115 |
| 44.73333333333208 | 13667012466.005 |
| 44.74999999999874 | 13660612869.189 |
| 44.76666666666541 | 13654208998.669 |
| 44.783333333332074 | 13647800850.437 |
| 44.79999999999874 | 13641388420.478 |
| 44.816666666665405 | 13634971704.767 |
| 44.83333333333207 | 13628550699.273 |
| 44.84999999999874 | 13622125399.953 |
| 44.8666666666654 | 13615695802.759 |
| 44.88333333333207 | 13609261903.633 |
| 44.899999999998734 | 13602823698.51 |
| 44.9166666666654 | 13596381183.313 |
| 44.933333333332065 | 13589934353.961 |
| 44.94999999999873 | 13583483206.36 |
| 44.9666666666654 | 13577027736.412 |
| 44.98333333333206 | 13570567940.007 |
| 44.99999999999873 | 13564103813.027 |
| 45.016666666665394 | 13557635351.347 |
| 45.03333333333206 | 13551162550.831 |
| 45.049999999998725 | 13544685407.335 |
| 45.06666666666539 | 13538203916.709 |
| 45.08333333333206 | 13531718074.79 |
| 45.09999999999872 | 13525227877.409 |
| 45.11666666666539 | 13518733320.387 |
| 45.133333333332054 | 13512234399.536 |
| 45.14999999999872 | 13505731110.661 |
| 45.166666666665385 | 13499223449.557 |
| 45.18333333333205 | 13492711412.008 |
| 45.19999999999872 | 13486194993.793 |
| 45.21666666666538 | 13479674190.678 |
| 45.23333333333205 | 13473148998.424 |
| 45.249999999998714 | 13466619412.78 |
| 45.26666666666538 | 13460085429.488 |
| 45.283333333332045 | 13453547044.278 |
| 45.29999999999871 | 13447004252.874 |
| 45.31666666666538 | 13440457050.99 |
| 45.33333333333204 | 13433905434.329 |
| 45.34999999999871 | 13427349398.589 |
| 45.366666666665374 | 13420788939.453 |
| 45.38333333333204 | 13414224052.6 |
| 45.399999999998705 | 13407654733.698 |
| 45.41666666666537 | 13401080978.403 |
| 45.43333333333204 | 13394502782.366 |
| 45.4499999999987 | 13387920141.226 |
| 45.46666666666537 | 13381333050.614 |
| 45.483333333332034 | 13374741506.15 |
| 45.4999999999987 | 13368145503.445 |
| 45.516666666665365 | 13361545038.102 |
| 45.53333333333203 | 13354940105.714 |
| 45.5499999999987 | 13348330701.862 |
| 45.56666666666536 | 13341716822.122 |
| 45.58333333333203 | 13335098462.055 |
| 45.599999999998694 | 13328475617.218 |
| 45.61666666666536 | 13321848283.153 |
| 45.633333333332025 | 13315216455.397 |
| 45.64999999999869 | 13308580129.474 |
| 45.66666666666536 | 13301939300.9 |
| 45.68333333333202 | 13295293965.181 |
| 45.69999999999869 | 13288644117.813 |
| 45.716666666665354 | 13281989754.281 |
| 45.73333333333202 | 13275330870.062 |
| 45.749999999998685 | 13268667460.622 |
| 45.76666666666535 | 13261999521.419 |
| 45.78333333333202 | 13255327047.897 |
| 45.79999999999868 | 13248650035.495 |
| 45.81666666666535 | 13241968479.639 |
| 45.833333333332014 | 13235282375.744 |
| 45.84999999999868 | 13228591719.219 |
| 45.866666666665346 | 13221896505.458 |
| 45.88333333333201 | 13215196729.848 |
| 45.89999999999868 | 13208492387.766 |
| 45.91666666666534 | 13201783474.577 |
| 45.93333333333201 | 13195069985.636 |
| 45.949999999998674 | 13188351916.29 |
| 45.96666666666534 | 13181629261.874 |
| 45.983333333332006 | 13174902017.712 |
| 45.99999999999867 | 13168170179.118 |
| 46.01666666666534 | 13161433741.397 |
| 46.033333333332 | 13154692699.842 |
| 46.04999999999867 | 13147947049.737 |
| 46.066666666665334 | 13141196786.355 |
| 46.083333333332 | 13134441904.957 |
| 46.099999999998666 | 13127682400.794 |
| 46.11666666666533 | 13120918269.11 |
| 46.133333333332 | 13114149505.132 |
| 46.14999999999866 | 13107376104.083 |
| 46.16666666666533 | 13100598061.169 |
| 46.183333333331994 | 13093815371.591 |
| 46.19999999999866 | 13087028030.535 |
| 46.216666666665326 | 13080236033.179 |
| 46.23333333333199 | 13073439374.688 |
| 46.24999999999866 | 13066638050.218 |
| 46.26666666666532 | 13059832054.912 |
| 46.28333333333199 | 13053021383.905 |
| 46.299999999998654 | 13046206032.319 |
| 46.31666666666532 | 13039385995.264 |
| 46.333333333331986 | 13032561267.842 |
| 46.34999999999865 | 13025731845.142 |
| 46.36666666666532 | 13018897722.241 |
| 46.38333333333198 | 13012058894.208 |
| 46.39999999999865 | 13005215356.097 |
| 46.416666666665314 | 12998367102.954 |
| 46.43333333333198 | 12991514129.812 |
| 46.449999999998646 | 12984656431.693 |
| 46.46666666666531 | 12977794003.608 |
| 46.48333333333198 | 12970926840.557 |
| 46.49999999999864 | 12964054937.527 |
| 46.51666666666531 | 12957178289.495 |
| 46.533333333331974 | 12950296891.426 |
| 46.54999999999864 | 12943410738.275 |
| 46.566666666665306 | 12936519824.983 |
| 46.58333333333197 | 12929624146.48 |
| 46.59999999999864 | 12922723697.686 |
| 46.6166666666653 | 12915818473.509 |
| 46.63333333333197 | 12908908468.842 |
| 46.649999999998634 | 12901993678.572 |
| 46.6666666666653 | 12895074097.569 |
| 46.683333333331966 | 12888149720.694 |
| 46.69999999999863 | 12881220542.795 |
| 46.7166666666653 | 12874286558.709 |
| 46.73333333333196 | 12867347763.261 |
| 46.74999999999863 | 12860404151.263 |
| 46.766666666665294 | 12853455717.516 |
| 46.78333333333196 | 12846502456.809 |
| 46.799999999998626 | 12839544363.918 |
| 46.81666666666529 | 12832581433.607 |
| 46.83333333333196 | 12825613660.63 |
| 46.84999999999862 | 12818641039.725 |
| 46.86666666666529 | 12811663565.621 |
| 46.883333333331954 | 12804681233.033 |
| 46.89999999999862 | 12797694036.665 |
| 46.916666666665286 | 12790701971.207 |
| 46.93333333333195 | 12783705031.338 |
| 46.94999999999862 | 12776703211.724 |
| 46.96666666666528 | 12769696507.019 |
| 46.98333333333195 | 12762684911.863 |
| 46.999999999998614 | 12755668420.884 |
| 47.01666666666528 | 12748647028.699 |
| 47.033333333331946 | 12741620729.911 |
| 47.04999999999861 | 12734589519.11 |
| 47.06666666666528 | 12727553390.874 |
| 47.08333333333194 | 12720512339.768 |
| 47.09999999999861 | 12713466360.344 |
| 47.116666666665274 | 12706415447.141 |
| 47.13333333333194 | 12699359594.685 |
| 47.149999999998606 | 12692298797.49 |
| 47.16666666666527 | 12685233050.057 |
| 47.18333333333194 | 12678162346.871 |
| 47.1999999999986 | 12671086682.409 |
| 47.21666666666527 | 12664006051.13 |
| 47.233333333331935 | 12656920447.483 |
| 47.2499999999986 | 12649829865.902 |
| 47.266666666665266 | 12642734300.809 |
| 47.28333333333193 | 12635633746.612 |
| 47.2999999999986 | 12628528197.705 |
| 47.31666666666526 | 12621417648.471 |
| 47.33333333333193 | 12614302093.276 |
| 47.349999999998595 | 12607181526.475 |
| 47.36666666666526 | 12600055942.41 |
| 47.383333333331926 | 12592925335.407 |
| 47.39999999999859 | 12585789699.78 |
| 47.41666666666526 | 12578649029.829 |
| 47.43333333333192 | 12571503319.84 |
| 47.44999999999859 | 12564352564.086 |
| 47.466666666665255 | 12557196756.825 |
| 47.48333333333192 | 12550035892.302 |
| 47.499999999998586 | 12542869964.748 |
| 47.51666666666525 | 12535698968.379 |
| 47.53333333333192 | 12528522897.4 |
| 47.54999999999858 | 12521341745.997 |
| 47.56666666666525 | 12514155508.347 |
| 47.583333333331915 | 12506964178.609 |
| 47.59999999999858 | 12499767750.93 |
| 47.616666666665246 | 12492566219.442 |
| 47.63333333333191 | 12485359578.263 |
| 47.64999999999858 | 12478147821.496 |
| 47.66666666666524 | 12470930943.23 |
| 47.68333333333191 | 12463708937.54 |
| 47.699999999998575 | 12456481798.485 |
| 47.71666666666524 | 12449249520.111 |
| 47.733333333331906 | 12442012096.449 |
| 47.74999999999857 | 12434769521.515 |
| 47.76666666666524 | 12427521789.31 |
| 47.7833333333319 | 12420268893.822 |
| 47.79999999999857 | 12413010829.022 |
| 47.816666666665235 | 12405747588.867 |
| 47.8333333333319 | 12398479167.299 |
| 47.849999999998566 | 12391205558.246 |
| 47.86666666666523 | 12383926755.619 |
| 47.8833333333319 | 12376642753.315 |
| 47.89999999999856 | 12369353545.216 |
| 47.91666666666523 | 12362059125.19 |
| 47.933333333331895 | 12354759487.087 |
| 47.94999999999856 | 12347454624.743 |
| 47.966666666665226 | 12340144531.98 |
| 47.98333333333189 | 12332829202.602 |
| 47.99999999999856 | 12325508630.4 |
| 48.01666666666522 | 12318182809.148 |
| 48.03333333333189 | 12310851732.605 |
| 48.049999999998555 | 12303515394.514 |
| 48.06666666666522 | 12296173788.603 |
| 48.083333333331886 | 12288826908.583 |
| 48.09999999999855 | 12281474748.151 |
| 48.11666666666522 | 12274117300.986 |
| 48.13333333333188 | 12266754560.754 |
| 48.14999999999855 | 12259386521.101 |
| 48.166666666665215 | 12252013175.661 |
| 48.18333333333188 | 12244634518.049 |
| 48.199999999998546 | 12237250541.866 |
| 48.21666666666521 | 12229861240.695 |
| 48.23333333333188 | 12222466608.105 |
| 48.24999999999854 | 12215066637.646 |
| 48.26666666666521 | 12207661322.853 |
| 48.283333333331875 | 12200250657.244 |
| 48.29999999999854 | 12192834634.323 |
| 48.316666666665206 | 12185413247.573 |
| 48.33333333333187 | 12177986490.464 |
| 48.34999999999854 | 12170554356.448 |
| 48.3666666666652 | 12163116838.961 |
| 48.38333333333187 | 12155673931.421 |
| 48.399999999998535 | 12148225627.229 |
| 48.4166666666652 | 12140771919.771 |
| 48.433333333331866 | 12133312802.414 |
| 48.44999999999853 | 12125848268.509 |
| 48.4666666666652 | 12118378311.39 |
| 48.48333333333186 | 12110902924.374 |
| 48.49999999999853 | 12103422100.759 |
| 48.516666666665195 | 12095935833.828 |
| 48.53333333333186 | 12088444116.845 |
| 48.549999999998526 | 12080946943.058 |
| 48.56666666666519 | 12073444305.696 |
| 48.58333333333186 | 12065936197.971 |
| 48.59999999999852 | 12058422613.078 |
| 48.61666666666519 | 12050903544.193 |
| 48.633333333331855 | 12043378984.477 |
| 48.64999999999852 | 12035848927.07 |
| 48.666666666665186 | 12028313365.095 |
| 48.68333333333185 | 12020772291.658 |
| 48.69999999999852 | 12013225699.847 |
| 48.71666666666518 | 12005673582.73 |
| 48.73333333333185 | 11998115933.36 |
| 48.749999999998515 | 11990552744.768 |
| 48.76666666666518 | 11982984009.97 |
| 48.783333333331846 | 11975409721.962 |
| 48.79999999999851 | 11967829873.722 |
| 48.81666666666518 | 11960244458.209 |
| 48.833333333331844 | 11952653468.364 |
| 48.84999999999851 | 11945056897.11 |
| 48.866666666665175 | 11937454737.349 |
| 48.88333333333184 | 11929846981.968 |
| 48.899999999998506 | 11922233623.83 |
| 48.91666666666517 | 11914614655.784 |
| 48.93333333333184 | 11906990070.658 |
| 48.949999999998504 | 11899359861.26 |
| 48.96666666666517 | 11891724020.379 |
| 48.983333333331835 | 11884082540.788 |
| 48.9999999999985 | 11876435415.236 |
| 49.01666666666517 | 11868782636.457 |
| 49.03333333333183 | 11861124197.161 |
| 49.0499999999985 | 11853460090.043 |
| 49.066666666665164 | 11845790307.775 |
| 49.08333333333183 | 11838114843.012 |
| 49.099999999998495 | 11830433688.388 |
| 49.11666666666516 | 11822746836.516 |
| 49.13333333333183 | 11815054279.991 |
| 49.14999999999849 | 11807356011.388 |
| 49.16666666666516 | 11799652023.26 |
| 49.183333333331824 | 11791942308.142 |
| 49.19999999999849 | 11784226858.549 |
| 49.216666666665155 | 11776505666.972 |
| 49.23333333333182 | 11768778725.888 |
| 49.24999999999849 | 11761046027.747 |
| 49.26666666666515 | 11753307564.982 |
| 49.28333333333182 | 11745563330.007 |
| 49.299999999998484 | 11737813315.21 |
| 49.31666666666515 | 11730057512.964 |
| 49.333333333331815 | 11722295915.618 |
| 49.34999999999848 | 11714528515.5 |
| 49.36666666666515 | 11706755304.919 |
| 49.38333333333181 | 11698976276.16 |
| 49.39999999999848 | 11691191421.49 |
| 49.416666666665144 | 11683400733.153 |
| 49.43333333333181 | 11675604203.371 |
| 49.449999999998475 | 11667801824.346 |
| 49.46666666666514 | 11659993588.258 |
| 49.48333333333181 | 11652179487.266 |
| 49.49999999999847 | 11644359513.507 |
| 49.51666666666514 | 11636533659.095 |
| 49.533333333331804 | 11628701916.123 |
| 49.54999999999847 | 11620864276.663 |
| 49.566666666665135 | 11613020732.765 |
| 49.5833333333318 | 11605171276.455 |
| 49.59999999999847 | 11597315899.738 |
| 49.61666666666513 | 11589454594.597 |
| 49.6333333333318 | 11581587352.993 |
| 49.649999999998464 | 11573714166.863 |
| 49.66666666666513 | 11565835028.123 |
| 49.683333333331795 | 11557949928.665 |
| 49.69999999999846 | 11550058860.359 |
| 49.71666666666513 | 11542161815.053 |
| 49.73333333333179 | 11534258784.57 |
| 49.74999999999846 | 11526349760.713 |
| 49.766666666665124 | 11518434735.259 |
| 49.78333333333179 | 11510513699.963 |
| 49.799999999998455 | 11502586646.557 |
| 49.81666666666512 | 11494653566.749 |
| 49.83333333333179 | 11486714452.225 |
| 49.84999999999845 | 11478769294.645 |
| 49.86666666666512 | 11470818085.647 |
| 49.883333333331784 | 11462860816.845 |
| 49.89999999999845 | 11454897479.829 |
| 49.916666666665115 | 11446928066.165 |
| 49.93333333333178 | 11438952567.395 |
| 49.94999999999845 | 11430970975.037 |
| 49.96666666666511 | 11422983280.585 |
| 49.98333333333178 | 11414989475.508 |
| 49.999999999998444 | 11406989551.25 |
| 50.01666666666511 | 11398983499.232 |
| 50.033333333331775 | 11390971310.851 |
| 50.04999999999844 | 11382952977.476 |
| 50.06666666666511 | 11374928490.453 |
| 50.08333333333177 | 11366897841.104 |
| 50.09999999999844 | 11358861020.725 |
| 50.116666666665104 | 11350818020.587 |
| 50.13333333333177 | 11342768831.935 |
| 50.149999999998435 | 11334713445.99 |
| 50.1666666666651 | 11326651853.946 |
| 50.18333333333177 | 11318584046.972 |
| 50.19999999999843 | 11310510016.212 |
| 50.2166666666651 | 11302429752.784 |
| 50.233333333331764 | 11294343247.78 |
| 50.24999999999843 | 11286250492.264 |
| 50.266666666665095 | 11278151477.278 |
| 50.28333333333176 | 11270046193.834 |
| 50.29999999999843 | 11261934632.919 |
| 50.31666666666509 | 11253816785.494 |
| 50.33333333333176 | 11245692642.494 |
| 50.349999999998424 | 11237562194.825 |
| 50.36666666666509 | 11229425433.367 |
| 50.383333333331755 | 11221282348.976 |
| 50.39999999999842 | 11213132932.477 |
| 50.41666666666509 | 11204977174.67 |
| 50.43333333333175 | 11196815066.328 |
| 50.44999999999842 | 11188646598.194 |
| 50.466666666665084 | 11180471760.987 |
| 50.48333333333175 | 11172290545.397 |
| 50.499999999998415 | 11164102942.085 |
| 50.51666666666508 | 11155908941.687 |
| 50.53333333333175 | 11147708534.808 |
| 50.54999999999841 | 11139501712.026 |
| 50.56666666666508 | 11131288463.892 |
| 50.583333333331744 | 11123068780.928 |
| 50.59999999999841 | 11114842653.626 |
| 50.616666666665076 | 11106610072.452 |
| 50.63333333333174 | 11098371027.842 |
| 50.64999999999841 | 11090125510.203 |
| 50.66666666666507 | 11081873509.913 |
| 50.68333333333174 | 11073615017.322 |
| 50.699999999998404 | 11065350022.75 |
| 50.71666666666507 | 11057078516.487 |
| 50.733333333331736 | 11048800488.796 |
| 50.7499999999984 | 11040515929.907 |
| 50.76666666666507 | 11032224830.024 |
| 50.78333333333173 | 11023927179.317 |
| 50.7999999999984 | 11015622967.931 |
| 50.816666666665064 | 11007312185.976 |
| 50.83333333333173 | 10998994823.535 |
| 50.849999999998396 | 10990670870.66 |
| 50.86666666666506 | 10982340317.372 |
| 50.88333333333173 | 10974003153.661 |
| 50.89999999999839 | 10965659369.488 |
| 50.91666666666506 | 10957308954.781 |
| 50.933333333331724 | 10948951899.438 |
| 50.94999999999839 | 10940588193.325 |
| 50.966666666665056 | 10932217826.28 |
| 50.98333333333172 | 10923840788.105 |
| 50.99999999999839 | 10915457068.572 |
| 51.01666666666505 | 10907066657.424 |
| 51.03333333333172 | 10898669544.367 |
| 51.049999999998384 | 10890265719.081 |
| 51.06666666666505 | 10881855171.208 |
| 51.083333333331716 | 10873437890.362 |
| 51.09999999999838 | 10865013866.122 |
| 51.11666666666505 | 10856583088.036 |
| 51.13333333333171 | 10848145545.618 |
| 51.14999999999838 | 10839701228.351 |
| 51.166666666665044 | 10831250125.683 |
| 51.18333333333171 | 10822792227.03 |
| 51.199999999998376 | 10814327521.773 |
| 51.21666666666504 | 10805855999.263 |
| 51.23333333333171 | 10797377648.813 |
| 51.24999999999837 | 10788892459.706 |
| 51.26666666666504 | 10780400421.189 |
| 51.283333333331704 | 10771901522.474 |
| 51.29999999999837 | 10763395752.743 |
| 51.316666666665036 | 10754883101.138 |
| 51.3333333333317 | 10746363556.771 |
| 51.34999999999837 | 10737837108.716 |
| 51.36666666666503 | 10729303746.015 |
| 51.3833333333317 | 10720763457.672 |
| 51.399999999998364 | 10712216232.659 |
| 51.41666666666503 | 10703662059.91 |
| 51.433333333331696 | 10695100928.325 |
| 51.44999999999836 | 10686532826.768 |
| 51.46666666666503 | 10677957744.066 |
| 51.48333333333169 | 10669375669.012 |
| 51.49999999999836 | 10660786590.361 |
| 51.516666666665024 | 10652190496.832 |
| 51.53333333333169 | 10643587377.11 |
| 51.549999999998356 | 10634977219.839 |
| 51.56666666666502 | 10626360013.629 |
| 51.58333333333169 | 10617735747.052 |
| 51.59999999999835 | 10609104408.645 |
| 51.61666666666502 | 10600465986.903 |
| 51.633333333331684 | 10591820470.288 |
| 51.64999999999835 | 10583167847.222 |
| 51.666666666665016 | 10574508106.089 |
| 51.68333333333168 | 10565841235.236 |
| 51.69999999999835 | 10557167222.971 |
| 51.71666666666501 | 10548486057.564 |
| 51.73333333333168 | 10539797727.246 |
| 51.749999999998344 | 10531102220.209 |
| 51.76666666666501 | 10522399524.606 |
| 51.783333333331676 | 10513689628.552 |
| 51.79999999999834 | 10504972520.121 |
| 51.81666666666501 | 10496248187.349 |
| 51.83333333333167 | 10487516618.23 |
| 51.84999999999834 | 10478777800.721 |
| 51.866666666665004 | 10470031722.736 |
| 51.88333333333167 | 10461278372.152 |
| 51.899999999998336 | 10452517736.801 |
| 51.916666666665 | 10443749804.479 |
| 51.93333333333167 | 10434974562.937 |
| 51.94999999999833 | 10426191999.888 |
| 51.966666666665 | 10417402103.003 |
| 51.983333333331665 | 10408604859.91 |
| 51.99999999999833 | 10399800258.196 |
| 52.016666666664996 | 10390988285.407 |
| 52.03333333333166 | 10382168929.047 |
| 52.04999999999833 | 10373342176.576 |
| 52.06666666666499 | 10364508015.413 |
| 52.08333333333166 | 10355666432.933 |
| 52.099999999998325 | 10346817416.469 |
| 52.11666666666499 | 10337960953.311 |
| 52.133333333331656 | 10329097030.705 |
| 52.14999999999832 | 10320225635.855 |
| 52.16666666666499 | 10311346755.918 |
| 52.18333333333165 | 10302460378.009 |
| 52.19999999999832 | 10293566489.201 |
| 52.216666666664985 | 10284665076.517 |
| 52.23333333333165 | 10275756126.942 |
| 52.249999999998316 | 10266839627.41 |
| 52.26666666666498 | 10257915564.814 |
| 52.28333333333165 | 10248983926 |
| 52.29999999999831 | 10240044697.769 |
| 52.31666666666498 | 10231097866.875 |
| 52.333333333331645 | 10222143420.029 |
| 52.34999999999831 | 10213181343.892 |
| 52.366666666664976 | 10204211625.08 |
| 52.38333333333164 | 10195234250.164 |
| 52.39999999999831 | 10186249205.666 |
| 52.41666666666497 | 10177256478.061 |
| 52.43333333333164 | 10168256053.778 |
| 52.449999999998305 | 10159247919.196 |
| 52.46666666666497 | 10150232060.649 |
| 52.483333333331636 | 10141208464.421 |
| 52.4999999999983 | 10132177116.747 |
| 52.51666666666497 | 10123138003.816 |
| 52.53333333333163 | 10114091111.765 |
| 52.5499999999983 | 10105036426.684 |
| 52.566666666664965 | 10095973934.613 |
| 52.58333333333163 | 10086903621.542 |
| 52.599999999998296 | 10077825473.412 |
| 52.61666666666496 | 10068739476.114 |
| 52.63333333333163 | 10059645615.487 |
| 52.64999999999829 | 10050543877.32 |
| 52.66666666666496 | 10041434247.352 |
| 52.683333333331625 | 10032316711.27 |
| 52.69999999999829 | 10023191254.711 |
| 52.716666666664956 | 10014057863.257 |
| 52.73333333333162 | 10004916522.442 |
| 52.74999999999829 | 9995767217.745 |
| 52.76666666666495 | 9986609934.593 |
| 52.78333333333162 | 9977444658.361 |
| 52.799999999998285 | 9968271374.371 |
| 52.81666666666495 | 9959090067.891 |
| 52.833333333331616 | 9949900724.135 |
| 52.84999999999828 | 9940703328.263 |
| 52.86666666666495 | 9931497865.384 |
| 52.88333333333161 | 9922284320.547 |
| 52.89999999999828 | 9913062678.751 |
| 52.916666666664945 | 9903832924.938 |
| 52.93333333333161 | 9894595043.995 |
| 52.949999999998276 | 9885349020.753 |
| 52.96666666666494 | 9876094839.986 |
| 52.98333333333161 | 9866832486.415 |
| 52.99999999999827 | 9857561944.702 |
| 53.01666666666494 | 9848283199.452 |
| 53.033333333331605 | 9838996235.214 |
| 53.04999999999827 | 9829701036.479 |
| 53.066666666664936 | 9820397587.681 |
| 53.0833333333316 | 9811085873.194 |
| 53.09999999999827 | 9801765877.337 |
| 53.11666666666493 | 9792437584.367 |
| 53.1333333333316 | 9783100978.484 |
| 53.149999999998265 | 9773756043.827 |
| 53.16666666666493 | 9764402764.478 |
| 53.183333333331596 | 9755041124.455 |
| 53.19999999999826 | 9745671107.721 |
| 53.21666666666493 | 9736292698.173 |
| 53.23333333333159 | 9726905879.652 |
| 53.24999999999826 | 9717510635.933 |
| 53.266666666664925 | 9708106950.733 |
| 53.28333333333159 | 9698694807.705 |
| 53.299999999998256 | 9689274190.442 |
| 53.31666666666492 | 9679845082.471 |
| 53.33333333333159 | 9670407467.259 |
| 53.34999999999825 | 9660961328.209 |
| 53.36666666666492 | 9651506648.659 |
| 53.383333333331585 | 9642043411.884 |
| 53.39999999999825 | 9632571601.094 |
| 53.416666666664916 | 9623091199.436 |
| 53.43333333333158 | 9613602189.99 |
| 53.44999999999825 | 9604104555.771 |
| 53.46666666666491 | 9594598279.729 |
| 53.48333333333158 | 9585083344.747 |
| 53.499999999998245 | 9575559733.641 |
| 53.51666666666491 | 9566027429.162 |
| 53.533333333331576 | 9556486413.992 |
| 53.54999999999824 | 9546936670.745 |
| 53.56666666666491 | 9537378181.969 |
| 53.583333333331574 | 9527810930.14 |
| 53.59999999999824 | 9518234897.67 |
| 53.616666666664905 | 9508650066.898 |
| 53.63333333333157 | 9499056420.094 |
| 53.649999999998236 | 9489453939.459 |
| 53.6666666666649 | 9479842607.123 |
| 53.68333333333157 | 9470222405.146 |
| 53.699999999998234 | 9460593315.515 |
| 53.7166666666649 | 9450955320.147 |
| 53.733333333331565 | 9441308400.887 |
| 53.74999999999823 | 9431652539.506 |
| 53.7666666666649 | 9421987717.703 |
| 53.78333333333156 | 9412313917.104 |
| 53.79999999999823 | 9402631119.262 |
| 53.816666666664894 | 9392939305.654 |
| 53.83333333333156 | 9383238457.683 |
| 53.849999999998225 | 9373528556.678 |
| 53.86666666666489 | 9363809583.892 |
| 53.88333333333156 | 9354081520.502 |
| 53.89999999999822 | 9344344347.608 |
| 53.91666666666489 | 9334598046.235 |
| 53.933333333331554 | 9324842597.329 |
| 53.94999999999822 | 9315077981.759 |
| 53.966666666664885 | 9305304180.317 |
| 53.98333333333155 | 9295521173.713 |
| 53.99999999999822 | 9285728942.583 |
| 54.01666666666488 | 9275927467.479 |
| 54.03333333333155 | 9266116728.876 |
| 54.049999999998214 | 9256296707.166 |
| 54.06666666666488 | 9246467382.662 |
| 54.083333333331545 | 9236628735.595 |
| 54.09999999999821 | 9226780746.114 |
| 54.11666666666488 | 9216923394.285 |
| 54.13333333333154 | 9207056660.093 |
| 54.14999999999821 | 9197180523.437 |
| 54.166666666664874 | 9187294964.135 |
| 54.18333333333154 | 9177399961.917 |
| 54.199999999998205 | 9167495496.432 |
| 54.21666666666487 | 9157581547.241 |
| 54.23333333333154 | 9147658093.819 |
| 54.2499999999982 | 9137725115.557 |
| 54.26666666666487 | 9127782591.756 |
| 54.283333333331534 | 9117830501.631 |
| 54.2999999999982 | 9107868824.309 |
| 54.316666666664865 | 9097897538.828 |
| 54.33333333333153 | 9087916624.138 |
| 54.3499999999982 | 9077926059.097 |
| 54.36666666666486 | 9067925822.475 |
| 54.38333333333153 | 9057915892.95 |
| 54.399999999998194 | 9047896249.109 |
| 54.41666666666486 | 9037866869.448 |
| 54.433333333331525 | 9027827732.369 |
| 54.44999999999819 | 9017778816.181 |
| 54.46666666666486 | 9007720099.101 |
| 54.48333333333152 | 8997651559.25 |
| 54.49999999999819 | 8987573174.655 |
| 54.516666666664854 | 8977484923.249 |
| 54.53333333333152 | 8967386782.866 |
| 54.549999999998185 | 8957278731.245 |
| 54.56666666666485 | 8947160746.029 |
| 54.58333333333152 | 8937032804.761 |
| 54.59999999999818 | 8926894884.886 |
| 54.61666666666485 | 8916746963.752 |
| 54.633333333331514 | 8906589018.606 |
| 54.64999999999818 | 8896421026.593 |
| 54.666666666664845 | 8886242964.759 |
| 54.68333333333151 | 8876054810.049 |
| 54.69999999999818 | 8865856539.303 |
| 54.71666666666484 | 8855648129.262 |
| 54.73333333333151 | 8845429556.56 |
| 54.749999999998174 | 8835200797.728 |
| 54.76666666666484 | 8824961829.192 |
| 54.783333333331505 | 8814712627.273 |
| 54.79999999999817 | 8804453168.186 |
| 54.81666666666484 | 8794183428.037 |
| 54.8333333333315 | 8783903382.828 |
| 54.84999999999817 | 8773613008.448 |
| 54.866666666664834 | 8763312280.681 |
| 54.8833333333315 | 8753001175.198 |
| 54.899999999998165 | 8742679667.564 |
| 54.91666666666483 | 8732347733.227 |
| 54.9333333333315 | 8722005347.528 |
| 54.94999999999816 | 8711652485.694 |
| 54.96666666666483 | 8701289122.836 |
| 54.983333333331494 | 8690915233.954 |
| 54.99999999999816 | 8680530793.931 |
| 55.016666666664825 | 8670135777.538 |
| 55.03333333333149 | 8659730159.424 |
| 55.04999999999816 | 8649313914.125 |
| 55.06666666666482 | 8638887016.057 |
| 55.08333333333149 | 8628449439.519 |
| 55.099999999998154 | 8618001158.688 |
| 55.11666666666482 | 8607542147.623 |
| 55.133333333331485 | 8597072380.261 |
| 55.14999999999815 | 8586591830.415 |
| 55.16666666666482 | 8576100471.779 |
| 55.18333333333148 | 8565598277.92 |
| 55.19999999999815 | 8555085222.282 |
| 55.216666666664814 | 8544561278.184 |
| 55.23333333333148 | 8534026418.817 |
| 55.249999999998145 | 8523480617.247 |
| 55.26666666666481 | 8512923846.411 |
| 55.28333333333148 | 8502356079.118 |
| 55.29999999999814 | 8491777288.046 |
| 55.31666666666481 | 8481187445.743 |
| 55.333333333331474 | 8470586524.626 |
| 55.34999999999814 | 8459974496.979 |
| 55.366666666664806 | 8449351334.953 |
| 55.38333333333147 | 8438717010.564 |
| 55.39999999999814 | 8428071495.695 |
| 55.4166666666648 | 8417414762.09 |
| 55.43333333333147 | 8406746781.359 |
| 55.449999999998134 | 8396067524.97 |
| 55.4666666666648 | 8385376964.256 |
| 55.483333333331466 | 8374675070.407 |
| 55.49999999999813 | 8363961814.475 |
| 55.5166666666648 | 8353237167.367 |
| 55.53333333333146 | 8342501099.849 |
| 55.54999999999813 | 8331753582.542 |
| 55.566666666664794 | 8320994585.924 |
| 55.58333333333146 | 8310224080.323 |
| 55.599999999998126 | 8299442035.924 |
| 55.61666666666479 | 8288648422.762 |
| 55.63333333333146 | 8277843210.723 |
| 55.64999999999812 | 8267026369.542 |
| 55.66666666666479 | 8256197868.804 |
| 55.683333333331454 | 8245357677.942 |
| 55.69999999999812 | 8234505766.233 |
| 55.716666666664786 | 8223642102.801 |
| 55.73333333333145 | 8212766656.615 |
| 55.74999999999812 | 8201879396.485 |
| 55.76666666666478 | 8190980291.065 |
| 55.78333333333145 | 8180069308.848 |
| 55.799999999998114 | 8169146418.168 |
| 55.81666666666478 | 8158211587.196 |
| 55.833333333331446 | 8147264783.943 |
| 55.84999999999811 | 8136305976.253 |
| 55.86666666666478 | 8125335131.806 |
| 55.88333333333144 | 8114352218.116 |
| 55.89999999999811 | 8103357202.529 |
| 55.916666666664774 | 8092350052.221 |
| 55.93333333333144 | 8081330734.202 |
| 55.949999999998106 | 8070299215.304 |
| 55.96666666666477 | 8059255462.193 |
| 55.98333333333144 | 8048199441.356 |
| 55.9999999999981 | 8037131119.108 |
| 56.01666666666477 | 8026050461.585 |
| 56.033333333331434 | 8014957434.746 |
| 56.0499999999981 | 8003852004.372 |
| 56.066666666664766 | 7992734136.061 |
| 56.08333333333143 | 7981603795.23 |
| 56.0999999999981 | 7970460947.113 |
| 56.11666666666476 | 7959305556.759 |
| 56.13333333333143 | 7948137589.03 |
| 56.149999999998094 | 7936957008.6 |
| 56.16666666666476 | 7925763779.957 |
| 56.183333333331426 | 7914557867.394 |
| 56.19999999999809 | 7903339235.014 |
| 56.21666666666476 | 7892107846.727 |
| 56.23333333333142 | 7880863666.247 |
| 56.24999999999809 | 7869606657.093 |
| 56.266666666664754 | 7858336782.582 |
| 56.28333333333142 | 7847054005.835 |
| 56.299999999998086 | 7835758289.771 |
| 56.31666666666475 | 7824449597.106 |
| 56.33333333333142 | 7813127890.35 |
| 56.34999999999808 | 7801793131.808 |
| 56.36666666666475 | 7790445283.579 |
| 56.383333333331414 | 7779084307.55 |
| 56.39999999999808 | 7767710165.399 |
| 56.416666666664746 | 7756322818.589 |
| 56.43333333333141 | 7744922228.371 |
| 56.44999999999808 | 7733508355.778 |
| 56.46666666666474 | 7722081161.626 |
| 56.48333333333141 | 7710640606.511 |
| 56.499999999998074 | 7699186650.809 |
| 56.51666666666474 | 7687719254.67 |
| 56.533333333331406 | 7676238378.022 |
| 56.54999999999807 | 7664743980.563 |
| 56.56666666666474 | 7653236021.766 |
| 56.5833333333314 | 7641714460.869 |
| 56.59999999999807 | 7630179256.882 |
| 56.616666666664734 | 7618630368.577 |
| 56.6333333333314 | 7607067754.491 |
| 56.649999999998066 | 7595491372.924 |
| 56.66666666666473 | 7583901181.934 |
| 56.6833333333314 | 7572297139.336 |
| 56.69999999999806 | 7560679202.704 |
| 56.71666666666473 | 7549047329.362 |
| 56.733333333331394 | 7537401476.387 |
| 56.74999999999806 | 7525741600.607 |
| 56.766666666664726 | 7514067658.596 |
| 56.78333333333139 | 7502379606.672 |
| 56.79999999999806 | 7490677400.898 |
| 56.81666666666472 | 7478960997.077 |
| 56.83333333333139 | 7467230350.752 |
| 56.849999999998055 | 7455485417.202 |
| 56.86666666666472 | 7443726151.437 |
| 56.883333333331386 | 7431952508.205 |
| 56.89999999999805 | 7420164441.978 |
| 56.91666666666472 | 7408361906.959 |
| 56.93333333333138 | 7396544857.074 |
| 56.94999999999805 | 7384713245.973 |
| 56.966666666664715 | 7372867027.024 |
| 56.98333333333138 | 7361006153.315 |
| 56.999999999998046 | 7349130577.648 |
| 57.01666666666471 | 7337240252.538 |
| 57.03333333333138 | 7325335130.21 |
| 57.04999999999804 | 7313415162.598 |
| 57.06666666666471 | 7301480301.339 |
| 57.083333333331375 | 7289530497.774 |
| 57.09999999999804 | 7277565702.943 |
| 57.116666666664706 | 7265585867.584 |
| 57.13333333333137 | 7253590942.129 |
| 57.14999999999804 | 7241580876.701 |
| 57.1666666666647 | 7229555621.114 |
| 57.18333333333137 | 7217515124.865 |
| 57.199999999998035 | 7205459337.137 |
| 57.2166666666647 | 7193388206.793 |
| 57.233333333331366 | 7181301682.372 |
| 57.24999999999803 | 7169199712.09 |
| 57.2666666666647 | 7157082243.833 |
| 57.28333333333136 | 7144949225.155 |
| 57.29999999999803 | 7132800603.278 |
| 57.316666666664695 | 7120636325.084 |
| 57.33333333333136 | 7108456337.116 |
| 57.349999999998026 | 7096260585.573 |
| 57.36666666666469 | 7084049016.306 |
| 57.38333333333136 | 7071821574.818 |
| 57.39999999999802 | 7059578206.255 |
| 57.41666666666469 | 7047318855.411 |
| 57.433333333331355 | 7035043466.715 |
| 57.44999999999802 | 7022751984.236 |
| 57.466666666664686 | 7010444351.674 |
| 57.48333333333135 | 6998120512.361 |
| 57.49999999999802 | 6985780409.252 |
| 57.51666666666468 | 6973423984.926 |
| 57.53333333333135 | 6961051181.582 |
| 57.549999999998015 | 6948661941.033 |
| 57.56666666666468 | 6936256204.703 |
| 57.583333333331346 | 6923833913.625 |
| 57.59999999999801 | 6911395008.435 |
| 57.61666666666468 | 6898939429.37 |
| 57.63333333333134 | 6886467116.263 |
| 57.64999999999801 | 6873978008.539 |
| 57.666666666664675 | 6861472045.213 |
| 57.68333333333134 | 6848949164.881 |
| 57.699999999998006 | 6836409305.723 |
| 57.71666666666467 | 6823852405.492 |
| 57.73333333333134 | 6811278401.514 |
| 57.749999999998 | 6798687230.684 |
| 57.76666666666467 | 6786078829.459 |
| 57.783333333331335 | 6773453133.854 |
| 57.799999999998 | 6760810079.441 |
| 57.816666666664666 | 6748149601.339 |
| 57.83333333333133 | 6735471634.216 |
| 57.849999999998 | 6722776112.278 |
| 57.86666666666466 | 6710062969.268 |
| 57.88333333333133 | 6697332138.463 |
| 57.899999999997995 | 6684583552.662 |
| 57.91666666666466 | 6671817144.191 |
| 57.933333333331326 | 6659032844.889 |
| 57.94999999999799 | 6646230586.11 |
| 57.96666666666466 | 6633410298.712 |
| 57.98333333333132 | 6620571913.058 |
| 57.99999999999799 | 6607715359.006 |
| 58.016666666664655 | 6594840565.905 |
| 58.03333333333132 | 6581947462.591 |
| 58.049999999997986 | 6569035977.381 |
| 58.06666666666465 | 6556106038.066 |
| 58.08333333333132 | 6543157571.908 |
| 58.09999999999798 | 6530190505.631 |
| 58.11666666666465 | 6517204765.421 |
| 58.133333333331315 | 6504200276.914 |
| 58.14999999999798 | 6491176965.191 |
| 58.166666666664646 | 6478134754.779 |
| 58.18333333333131 | 6465073569.634 |
| 58.19999999999798 | 6451993333.145 |
| 58.21666666666464 | 6438893968.121 |
| 58.23333333333131 | 6425775396.789 |
| 58.249999999997975 | 6412637540.783 |
| 58.26666666666464 | 6399480321.143 |
| 58.283333333331306 | 6386303658.304 |
| 58.29999999999797 | 6373107472.093 |
| 58.31666666666464 | 6359891681.718 |
| 58.3333333333313 | 6346656205.765 |
| 58.34999999999797 | 6333400962.19 |
| 58.366666666664635 | 6320125868.309 |
| 58.3833333333313 | 6306830840.796 |
| 58.399999999997966 | 6293515795.672 |
| 58.41666666666463 | 6280180648.299 |
| 58.4333333333313 | 6266825313.371 |
| 58.449999999997964 | 6253449704.909 |
| 58.46666666666463 | 6240053736.253 |
| 58.483333333331295 | 6226637320.049 |
| 58.49999999999796 | 6213200368.251 |
| 58.51666666666463 | 6199742792.102 |
| 58.53333333333129 | 6186264502.133 |
| 58.54999999999796 | 6172765408.154 |
| 58.566666666664624 | 6159245419.243 |
| 58.58333333333129 | 6145704443.737 |
| 58.599999999997955 | 6132142389.229 |
| 58.61666666666462 | 6118559162.551 |
| 58.63333333333129 | 6104954669.773 |
| 58.64999999999795 | 6091328816.187 |
| 58.66666666666462 | 6077681506.303 |
| 58.683333333331284 | 6064012643.837 |
| 58.69999999999795 | 6050322131.702 |
| 58.716666666664615 | 6036609871.999 |
| 58.73333333333128 | 6022875766.005 |
| 58.74999999999795 | 6009119714.166 |
| 58.76666666666461 | 5995341616.085 |
| 58.78333333333128 | 5981541370.513 |
| 58.799999999997944 | 5967718875.335 |
| 58.81666666666461 | 5953874027.565 |
| 58.833333333331275 | 5940006723.332 |
| 58.84999999999794 | 5926116857.868 |
| 58.86666666666461 | 5912204325.497 |
| 58.88333333333127 | 5898269019.629 |
| 58.89999999999794 | 5884310832.74 |
| 58.916666666664604 | 5870329656.366 |
| 58.93333333333127 | 5856325381.091 |
| 58.949999999997935 | 5842297896.531 |
| 58.9666666666646 | 5828247091.328 |
| 58.98333333333127 | 5814172853.129 |
| 58.99999999999793 | 5800075068.581 |
| 59.0166666666646 | 5785953623.316 |
| 59.033333333331264 | 5771808401.933 |
| 59.04999999999793 | 5757639287.993 |
| 59.066666666664595 | 5743446163.999 |
| 59.08333333333126 | 5729228911.383 |
| 59.09999999999793 | 5714987410.495 |
| 59.11666666666459 | 5700721540.585 |
| 59.13333333333126 | 5686431179.793 |
| 59.149999999997924 | 5672116205.127 |
| 59.16666666666459 | 5657776492.457 |
| 59.183333333331255 | 5643411916.493 |
| 59.19999999999792 | 5629022350.769 |
| 59.21666666666459 | 5614607667.634 |
| 59.23333333333125 | 5600167738.228 |
| 59.24999999999792 | 5585702432.47 |
| 59.266666666664584 | 5571211619.041 |
| 59.28333333333125 | 5556695165.364 |
| 59.299999999997915 | 5542152937.591 |
| 59.31666666666458 | 5527584800.583 |
| 59.33333333333125 | 5512990617.889 |
| 59.34999999999791 | 5498370251.735 |
| 59.36666666666458 | 5483723562.998 |
| 59.383333333331244 | 5469050411.193 |
| 59.39999999999791 | 5454350654.448 |
| 59.416666666664575 | 5439624149.489 |
| 59.43333333333124 | 5424870751.619 |
| 59.44999999999791 | 5410090314.693 |
| 59.46666666666457 | 5395282691.104 |
| 59.48333333333124 | 5380447731.759 |
| 59.499999999997904 | 5365585286.054 |
| 59.51666666666457 | 5350695201.857 |
| 59.533333333331235 | 5335777325.484 |
| 59.5499999999979 | 5320831501.675 |
| 59.56666666666457 | 5305857573.57 |
| 59.58333333333123 | 5290855382.688 |
| 59.5999999999979 | 5275824768.902 |
| 59.616666666664564 | 5260765570.412 |
| 59.63333333333123 | 5245677623.722 |
| 59.649999999997895 | 5230560763.613 |
| 59.66666666666456 | 5215414823.12 |
| 59.68333333333123 | 5200239633.499 |
| 59.69999999999789 | 5185035024.206 |
| 59.71666666666456 | 5169800822.866 |
| 59.733333333331224 | 5154536855.246 |
| 59.74999999999789 | 5139242945.224 |
| 59.766666666664555 | 5123918914.762 |
| 59.78333333333122 | 5108564583.874 |
| 59.79999999999789 | 5093179770.596 |
| 59.81666666666455 | 5077764290.954 |
| 59.83333333333122 | 5062317958.934 |
| 59.849999999997884 | 5046840586.447 |
| 59.86666666666455 | 5031331983.295 |
| 59.883333333331215 | 5015791957.14 |
| 59.89999999999788 | 5000220313.466 |
| 59.91666666666455 | 4984616855.546 |
| 59.93333333333121 | 4968981384.403 |
| 59.94999999999788 | 4953313698.776 |
| 59.966666666664544 | 4937613595.078 |
| 59.98333333333121 | 4921880867.362 |
| 59.999999999997875 | 4906115307.278 |
| 60.01666666666454 | 4890316704.034 |
| 60.03333333333121 | 4874484844.352 |
| 60.04999999999787 | 4858619512.431 |
| 60.06666666666454 | 4842720489.899 |
| 60.083333333331204 | 4826787555.771 |
| 60.09999999999787 | 4810820486.402 |
| 60.116666666664536 | 4794819055.444 |
| 60.1333333333312 | 4778783033.795 |
| 60.14999999999787 | 4762712189.554 |
| 60.16666666666453 | 4746606287.97 |
| 60.1833333333312 | 4730465091.389 |
| 60.199999999997864 | 4714288359.207 |
| 60.21666666666453 | 4698075847.815 |
| 60.233333333331196 | 4681827310.541 |
| 60.24999999999786 | 4665542497.603 |
| 60.26666666666453 | 4649221156.042 |
| 60.28333333333119 | 4632863029.672 |
| 60.29999999999786 | 4616467859.017 |
| 60.316666666664524 | 4600035381.248 |
| 60.33333333333119 | 4583565330.124 |
| 60.349999999997856 | 4567057435.928 |
| 60.36666666666452 | 4550511425.398 |
| 60.38333333333119 | 4533927021.663 |
| 60.39999999999785 | 4517303944.171 |
| 60.41666666666452 | 4500641908.622 |
| 60.433333333331184 | 4483940626.894 |
| 60.44999999999785 | 4467199806.967 |
| 60.466666666664516 | 4450419152.848 |
| 60.48333333333118 | 4433598364.496 |
| 60.49999999999785 | 4416737137.736 |
| 60.51666666666451 | 4399835164.182 |
| 60.53333333333118 | 4382892131.15 |
| 60.549999999997844 | 4365907721.571 |
| 60.56666666666451 | 4348881613.905 |
| 60.583333333331176 | 4331813482.046 |
| 60.59999999999784 | 4314702995.233 |
| 60.61666666666451 | 4297549817.95 |
| 60.63333333333117 | 4280353609.827 |
| 60.64999999999784 | 4263114025.543 |
| 60.666666666664504 | 4245830714.717 |
| 60.68333333333117 | 4228503321.803 |
| 60.699999999997836 | 4211131485.98 |
| 60.7166666666645 | 4193714841.039 |
| 60.73333333333117 | 4176253015.266 |
| 60.74999999999783 | 4158745631.322 |
| 60.7666666666645 | 4141192306.122 |
| 60.783333333331164 | 4123592650.705 |
| 60.79999999999783 | 4105946270.11 |
| 60.816666666664496 | 4088252763.233 |
| 60.83333333333116 | 4070511722.697 |
| 60.84999999999783 | 4052722734.707 |
| 60.86666666666449 | 4034885378.903 |
| 60.88333333333116 | 4016999228.211 |
| 60.899999999997824 | 3999063848.688 |
| 60.91666666666449 | 3981078799.359 |
| 60.933333333331156 | 3963043632.057 |
| 60.94999999999782 | 3944957891.251 |
| 60.96666666666449 | 3926821113.872 |
| 60.98333333333115 | 3908632829.129 |
| 60.99999999999782 | 3890392558.329 |
| 61.016666666664484 | 3872099814.68 |
| 61.03333333333115 | 3853754103.095 |
| 61.049999999997816 | 3835354919.987 |
| 61.06666666666448 | 3816901753.06 |
| 61.08333333333115 | 3798394081.088 |
| 61.09999999999781 | 3779831373.691 |
| 61.11666666666448 | 3761213091.103 |
| 61.133333333331144 | 3742538683.932 |
| 61.14999999999781 | 3723807592.912 |
| 61.166666666664476 | 3705019248.644 |
| 61.18333333333114 | 3686173071.331 |
| 61.19999999999781 | 3667268470.508 |
| 61.21666666666447 | 3648304844.751 |
| 61.23333333333114 | 3629281581.388 |
| 61.249999999997804 | 3610198056.19 |
| 61.26666666666447 | 3591053633.061 |
| 61.283333333331136 | 3571847663.708 |
| 61.2999999999978 | 3552579487.302 |
| 61.31666666666447 | 3533248430.132 |
| 61.33333333333113 | 3513853805.235 |
| 61.3499999999978 | 3494394912.024 |
| 61.366666666664464 | 3474871035.893 |
| 61.38333333333113 | 3455281447.815 |
| 61.399999999997796 | 3435625403.918 |
| 61.41666666666446 | 3415902145.047 |
| 61.43333333333113 | 3396110896.314 |
| 61.44999999999779 | 3376250866.618 |
| 61.46666666666446 | 3356321248.164 |
| 61.483333333331124 | 3336321215.943 |
| 61.49999999999779 | 3316249927.209 |
| 61.516666666664456 | 3296106520.919 |
| 61.53333333333112 | 3275890117.168 |
| 61.54999999999779 | 3255599816.579 |
| 61.56666666666445 | 3235234699.688 |
| 61.58333333333112 | 3214793826.291 |
| 61.599999999997785 | 3194276234.765 |
| 61.61666666666445 | 3173680941.364 |
| 61.633333333331116 | 3153006939.479 |
| 61.64999999999778 | 3132253198.871 |
| 61.66666666666445 | 3111418664.863 |
| 61.68333333333111 | 3090502257.507 |
| 61.69999999999778 | 3069502870.701 |
| 61.716666666664445 | 3048419371.27 |
| 61.73333333333111 | 3027250598.013 |
| 61.749999999997776 | 3005995360.689 |
| 61.76666666666444 | 2984652438.974 |
| 61.78333333333111 | 2963220581.349 |
| 61.79999999999777 | 2941698503.952 |
| 61.81666666666444 | 2920084889.361 |
| 61.833333333331105 | 2898378385.326 |
| 61.84999999999777 | 2876577603.429 |
| 61.866666666664436 | 2854681117.684 |
| 61.8833333333311 | 2832687463.064 |
| 61.89999999999777 | 2810595133.947 |
| 61.91666666666443 | 2788402582.486 |
| 61.9333333333311 | 2766108216.89 |
| 61.949999999997765 | 2743710399.614 |
| 61.96666666666443 | 2721207445.452 |
| 61.983333333331096 | 2698597619.52 |
| 61.99999999999776 | 2675879135.132 |
| 62.01666666666443 | 2653050151.556 |
| 62.03333333333109 | 2630108771.635 |
| 62.04999999999776 | 2607053039.284 |
| 62.066666666664425 | 2583880936.82 |
| 62.08333333333109 | 2560590382.154 |
| 62.099999999997756 | 2537179225.799 |
| 62.11666666666442 | 2513645247.7 |
| 62.13333333333109 | 2489986153.87 |
| 62.14999999999775 | 2466199572.806 |
| 62.16666666666442 | 2442283051.685 |
| 62.183333333331085 | 2418234052.308 |
| 62.19999999999775 | 2394049946.778 |
| 62.216666666664416 | 2369728012.886 |
| 62.23333333333108 | 2345265429.191 |
| 62.24999999999775 | 2320659269.753 |
| 62.26666666666441 | 2295906498.5 |
| 62.28333333333108 | 2271003963.194 |
| 62.299999999997745 | 2245948388.953 |
| 62.31666666666441 | 2220736371.308 |
| 62.333333333331076 | 2195364368.728 |
| 62.34999999999774 | 2169828694.577 |
| 62.36666666666441 | 2144125508.451 |
| 62.38333333333107 | 2118250806.823 |
| 62.39999999999774 | 2092200412.939 |
| 62.416666666664405 | 2065969965.882 |
| 62.43333333333107 | 2039554908.718 |
| 62.449999999997736 | 2012950475.639 |
| 62.4666666666644 | 1986151677.973 |
| 62.48333333333107 | 1959153288.965 |
| 62.49999999999773 | 1931949827.166 |
| 62.5166666666644 | 1904535538.29 |
| 62.533333333331065 | 1876904375.349 |
| 62.54999999999773 | 1849049976.863 |
| 62.566666666664396 | 1820965642.923 |
| 62.58333333333106 | 1792644308.814 |
| 62.59999999999773 | 1764078515.907 |
| 62.61666666666439 | 1735260379.463 |
| 62.63333333333106 | 1706181552.918 |
| 62.649999999997725 | 1676833188.177 |
| 62.66666666666439 | 1647205891.359 |
| 62.683333333331056 | 1617289673.314 |
| 62.69999999999772 | 1587073894.154 |
| 62.71666666666439 | 1556547200.858 |
| 62.73333333333105 | 1525697456.884 |
| 62.74999999999772 | 1494511662.452 |
| 62.766666666664385 | 1462975863.967 |
| 62.78333333333105 | 1431075050.673 |
| 62.799999999997716 | 1398793036.266 |
| 62.81666666666438 | 1366112322.665 |
| 62.83333333333105 | 1333013942.535 |
| 62.84999999999771 | 1299477276.296 |
| 62.86666666666438 | 1265479838.374 |
| 62.883333333331045 | 1230997026.045 |
| 62.89999999999771 | 1196001822.499 |
| 62.916666666664376 | 1160464443.389 |
| 62.93333333333104 | 1124351913.041 |
| 62.94999999999771 | 1087627552.256 |
| 62.96666666666437 | 1050250353.883 |
| 62.98333333333104 | 1012174214.286 |
| 62.999999999997705 | 973346977.497 |
| 63.01666666666437 | 933709232.541 |
| 63.033333333331036 | 893192780.57 |
| 63.0499999999977 | 851718652.71 |
| 63.06666666666437 | 809194504.927 |
| 63.08333333333103 | 765511130.169 |
| 63.0999999999977 | 720537688.672 |
| 63.116666666664365 | 674115023.163 |
| 63.13333333333103 | 626046016.409 |
| 63.149999999997696 | 576081197.927 |
| 63.16666666666436 | 523896349.867 |
| 63.18333333333103 | 469055832.011 |
| 63.199999999997694 | 410948474.856 |
| 63.21666666666436 | 348665474.254 |
| 63.233333333331025 | 280738417.108 |
| 63.24999999999769 | 204467738.12 |
| 63.26666666666436 | 113592506.496 |
| 63.28333333333102 | -17743896.528 |